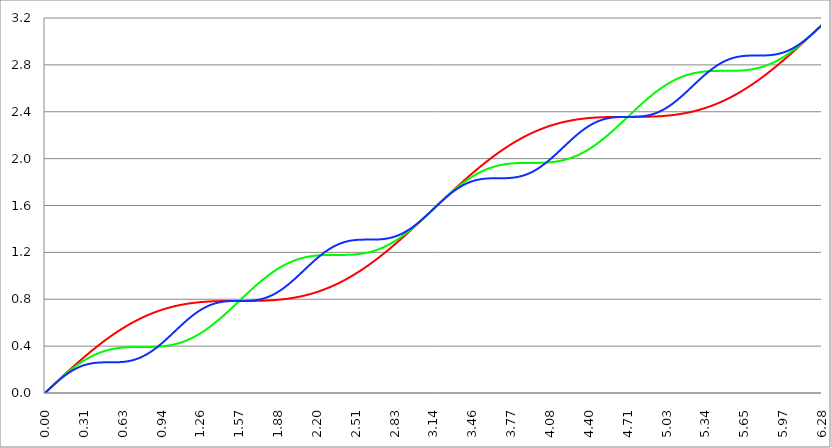
| Category | Series 1 | Series 0 | Series 2 |
|---|---|---|---|
| 0.0 | 0 | 0 | 0 |
| 0.00314159265358979 | 0.003 | 0.003 | 0.003 |
| 0.00628318530717958 | 0.006 | 0.006 | 0.006 |
| 0.00942477796076938 | 0.009 | 0.009 | 0.009 |
| 0.0125663706143592 | 0.013 | 0.013 | 0.013 |
| 0.015707963267949 | 0.016 | 0.016 | 0.016 |
| 0.0188495559215388 | 0.019 | 0.019 | 0.019 |
| 0.0219911485751285 | 0.022 | 0.022 | 0.022 |
| 0.0251327412287183 | 0.025 | 0.025 | 0.025 |
| 0.0282743338823081 | 0.028 | 0.028 | 0.028 |
| 0.0314159265358979 | 0.031 | 0.031 | 0.031 |
| 0.0345575191894877 | 0.035 | 0.035 | 0.034 |
| 0.0376991118430775 | 0.038 | 0.038 | 0.038 |
| 0.0408407044966673 | 0.041 | 0.041 | 0.041 |
| 0.0439822971502571 | 0.044 | 0.044 | 0.044 |
| 0.0471238898038469 | 0.047 | 0.047 | 0.047 |
| 0.0502654824574367 | 0.05 | 0.05 | 0.05 |
| 0.0534070751110265 | 0.053 | 0.053 | 0.053 |
| 0.0565486677646163 | 0.056 | 0.056 | 0.056 |
| 0.059690260418206 | 0.06 | 0.059 | 0.059 |
| 0.0628318530717958 | 0.063 | 0.063 | 0.062 |
| 0.0659734457253856 | 0.066 | 0.066 | 0.065 |
| 0.0691150383789754 | 0.069 | 0.069 | 0.068 |
| 0.0722566310325652 | 0.072 | 0.072 | 0.071 |
| 0.075398223686155 | 0.075 | 0.075 | 0.074 |
| 0.0785398163397448 | 0.078 | 0.078 | 0.077 |
| 0.0816814089933346 | 0.081 | 0.081 | 0.08 |
| 0.0848230016469244 | 0.085 | 0.084 | 0.083 |
| 0.0879645943005142 | 0.088 | 0.087 | 0.086 |
| 0.091106186954104 | 0.091 | 0.09 | 0.089 |
| 0.0942477796076937 | 0.094 | 0.093 | 0.092 |
| 0.0973893722612835 | 0.097 | 0.096 | 0.095 |
| 0.100530964914873 | 0.1 | 0.099 | 0.098 |
| 0.103672557568463 | 0.103 | 0.102 | 0.1 |
| 0.106814150222053 | 0.106 | 0.105 | 0.103 |
| 0.109955742875643 | 0.11 | 0.108 | 0.106 |
| 0.113097335529233 | 0.113 | 0.111 | 0.109 |
| 0.116238928182822 | 0.116 | 0.114 | 0.112 |
| 0.119380520836412 | 0.119 | 0.117 | 0.114 |
| 0.122522113490002 | 0.122 | 0.12 | 0.117 |
| 0.125663706143592 | 0.125 | 0.123 | 0.12 |
| 0.128805298797181 | 0.128 | 0.126 | 0.123 |
| 0.131946891450771 | 0.131 | 0.129 | 0.125 |
| 0.135088484104361 | 0.134 | 0.132 | 0.128 |
| 0.138230076757951 | 0.137 | 0.135 | 0.131 |
| 0.141371669411541 | 0.14 | 0.138 | 0.133 |
| 0.14451326206513 | 0.144 | 0.141 | 0.136 |
| 0.14765485471872 | 0.147 | 0.143 | 0.138 |
| 0.15079644737231 | 0.15 | 0.146 | 0.141 |
| 0.1539380400259 | 0.153 | 0.149 | 0.143 |
| 0.15707963267949 | 0.156 | 0.152 | 0.146 |
| 0.160221225333079 | 0.159 | 0.155 | 0.148 |
| 0.163362817986669 | 0.162 | 0.158 | 0.151 |
| 0.166504410640259 | 0.165 | 0.16 | 0.153 |
| 0.169646003293849 | 0.168 | 0.163 | 0.156 |
| 0.172787595947439 | 0.171 | 0.166 | 0.158 |
| 0.175929188601028 | 0.174 | 0.169 | 0.16 |
| 0.179070781254618 | 0.177 | 0.172 | 0.163 |
| 0.182212373908208 | 0.18 | 0.174 | 0.165 |
| 0.185353966561798 | 0.183 | 0.177 | 0.167 |
| 0.188495559215388 | 0.186 | 0.18 | 0.17 |
| 0.191637151868977 | 0.189 | 0.183 | 0.172 |
| 0.194778744522567 | 0.192 | 0.185 | 0.174 |
| 0.197920337176157 | 0.195 | 0.188 | 0.176 |
| 0.201061929829747 | 0.198 | 0.191 | 0.178 |
| 0.204203522483336 | 0.201 | 0.193 | 0.181 |
| 0.207345115136926 | 0.204 | 0.196 | 0.183 |
| 0.210486707790516 | 0.207 | 0.198 | 0.185 |
| 0.213628300444106 | 0.21 | 0.201 | 0.187 |
| 0.216769893097696 | 0.213 | 0.204 | 0.189 |
| 0.219911485751285 | 0.216 | 0.206 | 0.191 |
| 0.223053078404875 | 0.219 | 0.209 | 0.193 |
| 0.226194671058465 | 0.222 | 0.211 | 0.195 |
| 0.229336263712055 | 0.225 | 0.214 | 0.196 |
| 0.232477856365645 | 0.228 | 0.216 | 0.198 |
| 0.235619449019234 | 0.231 | 0.219 | 0.2 |
| 0.238761041672824 | 0.234 | 0.221 | 0.202 |
| 0.241902634326414 | 0.237 | 0.224 | 0.204 |
| 0.245044226980004 | 0.24 | 0.226 | 0.205 |
| 0.248185819633594 | 0.243 | 0.229 | 0.207 |
| 0.251327412287183 | 0.246 | 0.231 | 0.209 |
| 0.254469004940773 | 0.249 | 0.234 | 0.21 |
| 0.257610597594363 | 0.252 | 0.236 | 0.212 |
| 0.260752190247953 | 0.255 | 0.238 | 0.214 |
| 0.263893782901543 | 0.258 | 0.241 | 0.215 |
| 0.267035375555132 | 0.261 | 0.243 | 0.217 |
| 0.270176968208722 | 0.264 | 0.245 | 0.218 |
| 0.273318560862312 | 0.267 | 0.248 | 0.22 |
| 0.276460153515902 | 0.27 | 0.25 | 0.221 |
| 0.279601746169492 | 0.272 | 0.252 | 0.223 |
| 0.282743338823082 | 0.275 | 0.254 | 0.224 |
| 0.285884931476671 | 0.278 | 0.257 | 0.225 |
| 0.289026524130261 | 0.281 | 0.259 | 0.227 |
| 0.292168116783851 | 0.284 | 0.261 | 0.228 |
| 0.295309709437441 | 0.287 | 0.263 | 0.229 |
| 0.298451302091031 | 0.29 | 0.265 | 0.231 |
| 0.30159289474462 | 0.293 | 0.268 | 0.232 |
| 0.30473448739821 | 0.295 | 0.27 | 0.233 |
| 0.3078760800518 | 0.298 | 0.272 | 0.234 |
| 0.31101767270539 | 0.301 | 0.274 | 0.235 |
| 0.31415926535898 | 0.304 | 0.276 | 0.236 |
| 0.31730085801257 | 0.307 | 0.278 | 0.237 |
| 0.320442450666159 | 0.31 | 0.28 | 0.238 |
| 0.323584043319749 | 0.313 | 0.282 | 0.239 |
| 0.326725635973339 | 0.315 | 0.284 | 0.24 |
| 0.329867228626929 | 0.318 | 0.286 | 0.241 |
| 0.333008821280519 | 0.321 | 0.288 | 0.242 |
| 0.336150413934108 | 0.324 | 0.29 | 0.243 |
| 0.339292006587698 | 0.327 | 0.292 | 0.244 |
| 0.342433599241288 | 0.329 | 0.294 | 0.245 |
| 0.345575191894878 | 0.332 | 0.296 | 0.246 |
| 0.348716784548468 | 0.335 | 0.297 | 0.247 |
| 0.351858377202058 | 0.338 | 0.299 | 0.247 |
| 0.354999969855647 | 0.34 | 0.301 | 0.248 |
| 0.358141562509237 | 0.343 | 0.303 | 0.249 |
| 0.361283155162827 | 0.346 | 0.305 | 0.25 |
| 0.364424747816417 | 0.349 | 0.306 | 0.25 |
| 0.367566340470007 | 0.351 | 0.308 | 0.251 |
| 0.370707933123597 | 0.354 | 0.31 | 0.252 |
| 0.373849525777186 | 0.357 | 0.312 | 0.252 |
| 0.376991118430776 | 0.36 | 0.313 | 0.253 |
| 0.380132711084366 | 0.362 | 0.315 | 0.253 |
| 0.383274303737956 | 0.365 | 0.317 | 0.254 |
| 0.386415896391546 | 0.368 | 0.318 | 0.254 |
| 0.389557489045135 | 0.37 | 0.32 | 0.255 |
| 0.392699081698725 | 0.373 | 0.321 | 0.255 |
| 0.395840674352315 | 0.376 | 0.323 | 0.256 |
| 0.398982267005905 | 0.378 | 0.324 | 0.256 |
| 0.402123859659495 | 0.381 | 0.326 | 0.257 |
| 0.405265452313085 | 0.384 | 0.327 | 0.257 |
| 0.408407044966674 | 0.386 | 0.329 | 0.257 |
| 0.411548637620264 | 0.389 | 0.33 | 0.258 |
| 0.414690230273854 | 0.392 | 0.332 | 0.258 |
| 0.417831822927444 | 0.394 | 0.333 | 0.258 |
| 0.420973415581034 | 0.397 | 0.335 | 0.259 |
| 0.424115008234623 | 0.4 | 0.336 | 0.259 |
| 0.427256600888213 | 0.402 | 0.337 | 0.259 |
| 0.430398193541803 | 0.405 | 0.339 | 0.259 |
| 0.433539786195393 | 0.407 | 0.34 | 0.26 |
| 0.436681378848983 | 0.41 | 0.341 | 0.26 |
| 0.439822971502573 | 0.413 | 0.343 | 0.26 |
| 0.442964564156162 | 0.415 | 0.344 | 0.26 |
| 0.446106156809752 | 0.418 | 0.345 | 0.26 |
| 0.449247749463342 | 0.42 | 0.346 | 0.261 |
| 0.452389342116932 | 0.423 | 0.348 | 0.261 |
| 0.455530934770522 | 0.425 | 0.349 | 0.261 |
| 0.458672527424111 | 0.428 | 0.35 | 0.261 |
| 0.461814120077701 | 0.43 | 0.351 | 0.261 |
| 0.464955712731291 | 0.433 | 0.352 | 0.261 |
| 0.468097305384881 | 0.435 | 0.353 | 0.261 |
| 0.471238898038471 | 0.438 | 0.355 | 0.261 |
| 0.474380490692061 | 0.44 | 0.356 | 0.261 |
| 0.47752208334565 | 0.443 | 0.357 | 0.262 |
| 0.48066367599924 | 0.445 | 0.358 | 0.262 |
| 0.48380526865283 | 0.448 | 0.359 | 0.262 |
| 0.48694686130642 | 0.45 | 0.36 | 0.262 |
| 0.49008845396001 | 0.453 | 0.361 | 0.262 |
| 0.493230046613599 | 0.455 | 0.362 | 0.262 |
| 0.496371639267189 | 0.458 | 0.363 | 0.262 |
| 0.499513231920779 | 0.46 | 0.364 | 0.262 |
| 0.502654824574369 | 0.462 | 0.364 | 0.262 |
| 0.505796417227959 | 0.465 | 0.365 | 0.262 |
| 0.508938009881549 | 0.467 | 0.366 | 0.262 |
| 0.512079602535138 | 0.47 | 0.367 | 0.262 |
| 0.515221195188728 | 0.472 | 0.368 | 0.262 |
| 0.518362787842318 | 0.474 | 0.369 | 0.262 |
| 0.521504380495908 | 0.477 | 0.37 | 0.262 |
| 0.524645973149498 | 0.479 | 0.37 | 0.262 |
| 0.527787565803087 | 0.481 | 0.371 | 0.262 |
| 0.530929158456677 | 0.484 | 0.372 | 0.262 |
| 0.534070751110267 | 0.486 | 0.373 | 0.262 |
| 0.537212343763857 | 0.488 | 0.373 | 0.262 |
| 0.540353936417447 | 0.491 | 0.374 | 0.262 |
| 0.543495529071037 | 0.493 | 0.375 | 0.262 |
| 0.546637121724626 | 0.495 | 0.375 | 0.262 |
| 0.549778714378216 | 0.498 | 0.376 | 0.262 |
| 0.552920307031806 | 0.5 | 0.377 | 0.262 |
| 0.556061899685396 | 0.502 | 0.377 | 0.262 |
| 0.559203492338986 | 0.504 | 0.378 | 0.262 |
| 0.562345084992576 | 0.507 | 0.378 | 0.262 |
| 0.565486677646165 | 0.509 | 0.379 | 0.262 |
| 0.568628270299755 | 0.511 | 0.38 | 0.262 |
| 0.571769862953345 | 0.513 | 0.38 | 0.262 |
| 0.574911455606935 | 0.516 | 0.381 | 0.262 |
| 0.578053048260525 | 0.518 | 0.381 | 0.262 |
| 0.581194640914114 | 0.52 | 0.382 | 0.262 |
| 0.584336233567704 | 0.522 | 0.382 | 0.262 |
| 0.587477826221294 | 0.524 | 0.383 | 0.263 |
| 0.590619418874884 | 0.527 | 0.383 | 0.263 |
| 0.593761011528474 | 0.529 | 0.384 | 0.263 |
| 0.596902604182064 | 0.531 | 0.384 | 0.263 |
| 0.600044196835653 | 0.533 | 0.384 | 0.263 |
| 0.603185789489243 | 0.535 | 0.385 | 0.263 |
| 0.606327382142833 | 0.537 | 0.385 | 0.263 |
| 0.609468974796423 | 0.539 | 0.386 | 0.264 |
| 0.612610567450013 | 0.542 | 0.386 | 0.264 |
| 0.615752160103602 | 0.544 | 0.386 | 0.264 |
| 0.618893752757192 | 0.546 | 0.387 | 0.264 |
| 0.622035345410782 | 0.548 | 0.387 | 0.265 |
| 0.625176938064372 | 0.55 | 0.387 | 0.265 |
| 0.628318530717962 | 0.552 | 0.388 | 0.265 |
| 0.631460123371551 | 0.554 | 0.388 | 0.265 |
| 0.634601716025141 | 0.556 | 0.388 | 0.266 |
| 0.637743308678731 | 0.558 | 0.388 | 0.266 |
| 0.640884901332321 | 0.56 | 0.389 | 0.267 |
| 0.644026493985911 | 0.562 | 0.389 | 0.267 |
| 0.647168086639501 | 0.564 | 0.389 | 0.267 |
| 0.65030967929309 | 0.566 | 0.389 | 0.268 |
| 0.65345127194668 | 0.568 | 0.39 | 0.268 |
| 0.65659286460027 | 0.57 | 0.39 | 0.269 |
| 0.65973445725386 | 0.572 | 0.39 | 0.269 |
| 0.66287604990745 | 0.574 | 0.39 | 0.27 |
| 0.666017642561039 | 0.576 | 0.39 | 0.27 |
| 0.669159235214629 | 0.578 | 0.391 | 0.271 |
| 0.672300827868219 | 0.58 | 0.391 | 0.271 |
| 0.675442420521809 | 0.582 | 0.391 | 0.272 |
| 0.678584013175399 | 0.584 | 0.391 | 0.272 |
| 0.681725605828989 | 0.586 | 0.391 | 0.273 |
| 0.684867198482578 | 0.587 | 0.391 | 0.274 |
| 0.688008791136168 | 0.589 | 0.391 | 0.274 |
| 0.691150383789758 | 0.591 | 0.392 | 0.275 |
| 0.694291976443348 | 0.593 | 0.392 | 0.276 |
| 0.697433569096938 | 0.595 | 0.392 | 0.277 |
| 0.700575161750528 | 0.597 | 0.392 | 0.278 |
| 0.703716754404117 | 0.599 | 0.392 | 0.278 |
| 0.706858347057707 | 0.6 | 0.392 | 0.279 |
| 0.709999939711297 | 0.602 | 0.392 | 0.28 |
| 0.713141532364887 | 0.604 | 0.392 | 0.281 |
| 0.716283125018477 | 0.606 | 0.392 | 0.282 |
| 0.719424717672066 | 0.608 | 0.392 | 0.283 |
| 0.722566310325656 | 0.609 | 0.392 | 0.284 |
| 0.725707902979246 | 0.611 | 0.392 | 0.285 |
| 0.728849495632836 | 0.613 | 0.392 | 0.286 |
| 0.731991088286426 | 0.615 | 0.392 | 0.287 |
| 0.735132680940016 | 0.616 | 0.393 | 0.288 |
| 0.738274273593605 | 0.618 | 0.393 | 0.289 |
| 0.741415866247195 | 0.62 | 0.393 | 0.29 |
| 0.744557458900785 | 0.621 | 0.393 | 0.291 |
| 0.747699051554375 | 0.623 | 0.393 | 0.293 |
| 0.750840644207965 | 0.625 | 0.393 | 0.294 |
| 0.753982236861554 | 0.626 | 0.393 | 0.295 |
| 0.757123829515144 | 0.628 | 0.393 | 0.296 |
| 0.760265422168734 | 0.63 | 0.393 | 0.298 |
| 0.763407014822324 | 0.631 | 0.393 | 0.299 |
| 0.766548607475914 | 0.633 | 0.393 | 0.3 |
| 0.769690200129504 | 0.635 | 0.393 | 0.302 |
| 0.772831792783093 | 0.636 | 0.393 | 0.303 |
| 0.775973385436683 | 0.638 | 0.393 | 0.305 |
| 0.779114978090273 | 0.64 | 0.393 | 0.306 |
| 0.782256570743863 | 0.641 | 0.393 | 0.308 |
| 0.785398163397453 | 0.643 | 0.393 | 0.309 |
| 0.788539756051042 | 0.644 | 0.393 | 0.311 |
| 0.791681348704632 | 0.646 | 0.393 | 0.313 |
| 0.794822941358222 | 0.647 | 0.393 | 0.314 |
| 0.797964534011812 | 0.649 | 0.393 | 0.316 |
| 0.801106126665402 | 0.65 | 0.393 | 0.318 |
| 0.804247719318992 | 0.652 | 0.393 | 0.319 |
| 0.807389311972581 | 0.653 | 0.393 | 0.321 |
| 0.810530904626171 | 0.655 | 0.393 | 0.323 |
| 0.813672497279761 | 0.656 | 0.393 | 0.325 |
| 0.816814089933351 | 0.658 | 0.393 | 0.327 |
| 0.819955682586941 | 0.659 | 0.393 | 0.328 |
| 0.823097275240531 | 0.661 | 0.393 | 0.33 |
| 0.82623886789412 | 0.662 | 0.393 | 0.332 |
| 0.82938046054771 | 0.664 | 0.393 | 0.334 |
| 0.8325220532013 | 0.665 | 0.393 | 0.336 |
| 0.83566364585489 | 0.667 | 0.393 | 0.338 |
| 0.83880523850848 | 0.668 | 0.393 | 0.34 |
| 0.841946831162069 | 0.669 | 0.393 | 0.342 |
| 0.845088423815659 | 0.671 | 0.393 | 0.344 |
| 0.848230016469249 | 0.672 | 0.393 | 0.347 |
| 0.851371609122839 | 0.674 | 0.393 | 0.349 |
| 0.854513201776429 | 0.675 | 0.393 | 0.351 |
| 0.857654794430019 | 0.676 | 0.393 | 0.353 |
| 0.860796387083608 | 0.678 | 0.393 | 0.355 |
| 0.863937979737198 | 0.679 | 0.393 | 0.358 |
| 0.867079572390788 | 0.68 | 0.393 | 0.36 |
| 0.870221165044378 | 0.682 | 0.394 | 0.362 |
| 0.873362757697968 | 0.683 | 0.394 | 0.365 |
| 0.876504350351557 | 0.684 | 0.394 | 0.367 |
| 0.879645943005147 | 0.685 | 0.394 | 0.369 |
| 0.882787535658737 | 0.687 | 0.394 | 0.372 |
| 0.885929128312327 | 0.688 | 0.394 | 0.374 |
| 0.889070720965917 | 0.689 | 0.394 | 0.377 |
| 0.892212313619507 | 0.69 | 0.394 | 0.379 |
| 0.895353906273096 | 0.692 | 0.394 | 0.382 |
| 0.898495498926686 | 0.693 | 0.395 | 0.384 |
| 0.901637091580276 | 0.694 | 0.395 | 0.387 |
| 0.904778684233866 | 0.695 | 0.395 | 0.39 |
| 0.907920276887456 | 0.696 | 0.395 | 0.392 |
| 0.911061869541045 | 0.698 | 0.395 | 0.395 |
| 0.914203462194635 | 0.699 | 0.396 | 0.397 |
| 0.917345054848225 | 0.7 | 0.396 | 0.4 |
| 0.920486647501815 | 0.701 | 0.396 | 0.403 |
| 0.923628240155405 | 0.702 | 0.396 | 0.406 |
| 0.926769832808995 | 0.703 | 0.396 | 0.408 |
| 0.929911425462584 | 0.705 | 0.397 | 0.411 |
| 0.933053018116174 | 0.706 | 0.397 | 0.414 |
| 0.936194610769764 | 0.707 | 0.397 | 0.417 |
| 0.939336203423354 | 0.708 | 0.397 | 0.419 |
| 0.942477796076944 | 0.709 | 0.398 | 0.422 |
| 0.945619388730533 | 0.71 | 0.398 | 0.425 |
| 0.948760981384123 | 0.711 | 0.398 | 0.428 |
| 0.951902574037713 | 0.712 | 0.399 | 0.431 |
| 0.955044166691303 | 0.713 | 0.399 | 0.434 |
| 0.958185759344893 | 0.714 | 0.399 | 0.437 |
| 0.961327351998483 | 0.715 | 0.4 | 0.44 |
| 0.964468944652072 | 0.716 | 0.4 | 0.443 |
| 0.967610537305662 | 0.717 | 0.401 | 0.446 |
| 0.970752129959252 | 0.718 | 0.401 | 0.448 |
| 0.973893722612842 | 0.719 | 0.401 | 0.451 |
| 0.977035315266432 | 0.72 | 0.402 | 0.454 |
| 0.980176907920022 | 0.721 | 0.402 | 0.457 |
| 0.983318500573611 | 0.722 | 0.403 | 0.46 |
| 0.986460093227201 | 0.723 | 0.403 | 0.464 |
| 0.989601685880791 | 0.724 | 0.404 | 0.467 |
| 0.992743278534381 | 0.725 | 0.404 | 0.47 |
| 0.995884871187971 | 0.726 | 0.405 | 0.473 |
| 0.99902646384156 | 0.727 | 0.405 | 0.476 |
| 1.00216805649515 | 0.728 | 0.406 | 0.479 |
| 1.00530964914874 | 0.729 | 0.406 | 0.482 |
| 1.00845124180233 | 0.73 | 0.407 | 0.485 |
| 1.01159283445592 | 0.731 | 0.408 | 0.488 |
| 1.01473442710951 | 0.732 | 0.408 | 0.491 |
| 1.017876019763099 | 0.732 | 0.409 | 0.494 |
| 1.021017612416689 | 0.733 | 0.409 | 0.497 |
| 1.02415920507028 | 0.734 | 0.41 | 0.501 |
| 1.027300797723869 | 0.735 | 0.411 | 0.504 |
| 1.030442390377459 | 0.736 | 0.411 | 0.507 |
| 1.033583983031048 | 0.737 | 0.412 | 0.51 |
| 1.036725575684638 | 0.737 | 0.413 | 0.513 |
| 1.039867168338228 | 0.738 | 0.414 | 0.516 |
| 1.043008760991818 | 0.739 | 0.414 | 0.519 |
| 1.046150353645408 | 0.74 | 0.415 | 0.523 |
| 1.049291946298998 | 0.741 | 0.416 | 0.526 |
| 1.052433538952587 | 0.741 | 0.417 | 0.529 |
| 1.055575131606177 | 0.742 | 0.418 | 0.532 |
| 1.058716724259767 | 0.743 | 0.418 | 0.535 |
| 1.061858316913357 | 0.744 | 0.419 | 0.538 |
| 1.064999909566947 | 0.744 | 0.42 | 0.541 |
| 1.068141502220536 | 0.745 | 0.421 | 0.545 |
| 1.071283094874126 | 0.746 | 0.422 | 0.548 |
| 1.074424687527716 | 0.747 | 0.423 | 0.551 |
| 1.077566280181306 | 0.747 | 0.424 | 0.554 |
| 1.080707872834896 | 0.748 | 0.425 | 0.557 |
| 1.083849465488486 | 0.749 | 0.426 | 0.56 |
| 1.086991058142075 | 0.749 | 0.427 | 0.563 |
| 1.090132650795665 | 0.75 | 0.428 | 0.566 |
| 1.093274243449255 | 0.751 | 0.429 | 0.569 |
| 1.096415836102845 | 0.751 | 0.43 | 0.572 |
| 1.099557428756435 | 0.752 | 0.431 | 0.576 |
| 1.102699021410025 | 0.753 | 0.432 | 0.579 |
| 1.105840614063614 | 0.753 | 0.433 | 0.582 |
| 1.108982206717204 | 0.754 | 0.434 | 0.585 |
| 1.112123799370794 | 0.755 | 0.435 | 0.588 |
| 1.115265392024384 | 0.755 | 0.437 | 0.591 |
| 1.118406984677974 | 0.756 | 0.438 | 0.594 |
| 1.121548577331563 | 0.756 | 0.439 | 0.597 |
| 1.124690169985153 | 0.757 | 0.44 | 0.6 |
| 1.127831762638743 | 0.758 | 0.441 | 0.603 |
| 1.130973355292333 | 0.758 | 0.443 | 0.606 |
| 1.134114947945923 | 0.759 | 0.444 | 0.609 |
| 1.137256540599513 | 0.759 | 0.445 | 0.611 |
| 1.140398133253102 | 0.76 | 0.447 | 0.614 |
| 1.143539725906692 | 0.76 | 0.448 | 0.617 |
| 1.146681318560282 | 0.761 | 0.449 | 0.62 |
| 1.149822911213872 | 0.761 | 0.451 | 0.623 |
| 1.152964503867462 | 0.762 | 0.452 | 0.626 |
| 1.156106096521051 | 0.762 | 0.454 | 0.629 |
| 1.159247689174641 | 0.763 | 0.455 | 0.632 |
| 1.162389281828231 | 0.763 | 0.456 | 0.634 |
| 1.165530874481821 | 0.764 | 0.458 | 0.637 |
| 1.168672467135411 | 0.764 | 0.459 | 0.64 |
| 1.171814059789001 | 0.765 | 0.461 | 0.643 |
| 1.17495565244259 | 0.765 | 0.462 | 0.645 |
| 1.17809724509618 | 0.766 | 0.464 | 0.648 |
| 1.18123883774977 | 0.766 | 0.466 | 0.651 |
| 1.18438043040336 | 0.767 | 0.467 | 0.653 |
| 1.18752202305695 | 0.767 | 0.469 | 0.656 |
| 1.190663615710539 | 0.768 | 0.47 | 0.659 |
| 1.193805208364129 | 0.768 | 0.472 | 0.661 |
| 1.19694680101772 | 0.768 | 0.474 | 0.664 |
| 1.200088393671309 | 0.769 | 0.476 | 0.666 |
| 1.203229986324899 | 0.769 | 0.477 | 0.669 |
| 1.206371578978489 | 0.77 | 0.479 | 0.671 |
| 1.209513171632078 | 0.77 | 0.481 | 0.674 |
| 1.212654764285668 | 0.77 | 0.483 | 0.676 |
| 1.215796356939258 | 0.771 | 0.484 | 0.679 |
| 1.218937949592848 | 0.771 | 0.486 | 0.681 |
| 1.222079542246438 | 0.772 | 0.488 | 0.683 |
| 1.225221134900027 | 0.772 | 0.49 | 0.686 |
| 1.228362727553617 | 0.772 | 0.492 | 0.688 |
| 1.231504320207207 | 0.773 | 0.494 | 0.69 |
| 1.234645912860797 | 0.773 | 0.496 | 0.693 |
| 1.237787505514387 | 0.773 | 0.497 | 0.695 |
| 1.240929098167977 | 0.774 | 0.499 | 0.697 |
| 1.244070690821566 | 0.774 | 0.501 | 0.699 |
| 1.247212283475156 | 0.774 | 0.503 | 0.701 |
| 1.250353876128746 | 0.775 | 0.505 | 0.703 |
| 1.253495468782336 | 0.775 | 0.507 | 0.706 |
| 1.256637061435926 | 0.775 | 0.509 | 0.708 |
| 1.259778654089515 | 0.776 | 0.512 | 0.71 |
| 1.262920246743105 | 0.776 | 0.514 | 0.712 |
| 1.266061839396695 | 0.776 | 0.516 | 0.714 |
| 1.269203432050285 | 0.776 | 0.518 | 0.716 |
| 1.272345024703875 | 0.777 | 0.52 | 0.717 |
| 1.275486617357465 | 0.777 | 0.522 | 0.719 |
| 1.278628210011054 | 0.777 | 0.524 | 0.721 |
| 1.281769802664644 | 0.777 | 0.526 | 0.723 |
| 1.284911395318234 | 0.778 | 0.529 | 0.725 |
| 1.288052987971824 | 0.778 | 0.531 | 0.727 |
| 1.291194580625414 | 0.778 | 0.533 | 0.728 |
| 1.294336173279003 | 0.778 | 0.535 | 0.73 |
| 1.297477765932593 | 0.779 | 0.538 | 0.732 |
| 1.300619358586183 | 0.779 | 0.54 | 0.734 |
| 1.303760951239773 | 0.779 | 0.542 | 0.735 |
| 1.306902543893363 | 0.779 | 0.545 | 0.737 |
| 1.310044136546953 | 0.78 | 0.547 | 0.738 |
| 1.313185729200542 | 0.78 | 0.549 | 0.74 |
| 1.316327321854132 | 0.78 | 0.552 | 0.741 |
| 1.319468914507722 | 0.78 | 0.554 | 0.743 |
| 1.322610507161312 | 0.78 | 0.557 | 0.744 |
| 1.325752099814902 | 0.781 | 0.559 | 0.746 |
| 1.328893692468491 | 0.781 | 0.562 | 0.747 |
| 1.332035285122081 | 0.781 | 0.564 | 0.749 |
| 1.335176877775671 | 0.781 | 0.566 | 0.75 |
| 1.338318470429261 | 0.781 | 0.569 | 0.751 |
| 1.341460063082851 | 0.781 | 0.571 | 0.752 |
| 1.344601655736441 | 0.782 | 0.574 | 0.754 |
| 1.34774324839003 | 0.782 | 0.577 | 0.755 |
| 1.35088484104362 | 0.782 | 0.579 | 0.756 |
| 1.35402643369721 | 0.782 | 0.582 | 0.757 |
| 1.3571680263508 | 0.782 | 0.584 | 0.758 |
| 1.36030961900439 | 0.782 | 0.587 | 0.76 |
| 1.363451211657979 | 0.782 | 0.59 | 0.761 |
| 1.36659280431157 | 0.783 | 0.592 | 0.762 |
| 1.369734396965159 | 0.783 | 0.595 | 0.763 |
| 1.372875989618749 | 0.783 | 0.597 | 0.764 |
| 1.376017582272339 | 0.783 | 0.6 | 0.765 |
| 1.379159174925929 | 0.783 | 0.603 | 0.766 |
| 1.382300767579518 | 0.783 | 0.606 | 0.767 |
| 1.385442360233108 | 0.783 | 0.608 | 0.767 |
| 1.388583952886698 | 0.783 | 0.611 | 0.768 |
| 1.391725545540288 | 0.783 | 0.614 | 0.769 |
| 1.394867138193878 | 0.784 | 0.617 | 0.77 |
| 1.398008730847468 | 0.784 | 0.619 | 0.771 |
| 1.401150323501057 | 0.784 | 0.622 | 0.771 |
| 1.404291916154647 | 0.784 | 0.625 | 0.772 |
| 1.407433508808237 | 0.784 | 0.628 | 0.773 |
| 1.410575101461827 | 0.784 | 0.631 | 0.774 |
| 1.413716694115417 | 0.784 | 0.633 | 0.774 |
| 1.416858286769006 | 0.784 | 0.636 | 0.775 |
| 1.419999879422596 | 0.784 | 0.639 | 0.776 |
| 1.423141472076186 | 0.784 | 0.642 | 0.776 |
| 1.426283064729776 | 0.784 | 0.645 | 0.777 |
| 1.429424657383366 | 0.784 | 0.648 | 0.777 |
| 1.432566250036956 | 0.785 | 0.651 | 0.778 |
| 1.435707842690545 | 0.785 | 0.654 | 0.778 |
| 1.438849435344135 | 0.785 | 0.656 | 0.779 |
| 1.441991027997725 | 0.785 | 0.659 | 0.779 |
| 1.445132620651315 | 0.785 | 0.662 | 0.78 |
| 1.448274213304905 | 0.785 | 0.665 | 0.78 |
| 1.451415805958494 | 0.785 | 0.668 | 0.78 |
| 1.454557398612084 | 0.785 | 0.671 | 0.781 |
| 1.457698991265674 | 0.785 | 0.674 | 0.781 |
| 1.460840583919264 | 0.785 | 0.677 | 0.781 |
| 1.463982176572854 | 0.785 | 0.68 | 0.782 |
| 1.467123769226444 | 0.785 | 0.683 | 0.782 |
| 1.470265361880033 | 0.785 | 0.686 | 0.782 |
| 1.473406954533623 | 0.785 | 0.689 | 0.783 |
| 1.476548547187213 | 0.785 | 0.692 | 0.783 |
| 1.479690139840803 | 0.785 | 0.695 | 0.783 |
| 1.482831732494393 | 0.785 | 0.698 | 0.783 |
| 1.485973325147982 | 0.785 | 0.701 | 0.784 |
| 1.489114917801572 | 0.785 | 0.704 | 0.784 |
| 1.492256510455162 | 0.785 | 0.708 | 0.784 |
| 1.495398103108752 | 0.785 | 0.711 | 0.784 |
| 1.498539695762342 | 0.785 | 0.714 | 0.784 |
| 1.501681288415932 | 0.785 | 0.717 | 0.784 |
| 1.504822881069521 | 0.785 | 0.72 | 0.785 |
| 1.507964473723111 | 0.785 | 0.723 | 0.785 |
| 1.511106066376701 | 0.785 | 0.726 | 0.785 |
| 1.514247659030291 | 0.785 | 0.729 | 0.785 |
| 1.517389251683881 | 0.785 | 0.732 | 0.785 |
| 1.520530844337471 | 0.785 | 0.735 | 0.785 |
| 1.52367243699106 | 0.785 | 0.738 | 0.785 |
| 1.52681402964465 | 0.785 | 0.742 | 0.785 |
| 1.52995562229824 | 0.785 | 0.745 | 0.785 |
| 1.53309721495183 | 0.785 | 0.748 | 0.785 |
| 1.53623880760542 | 0.785 | 0.751 | 0.785 |
| 1.539380400259009 | 0.785 | 0.754 | 0.785 |
| 1.542521992912599 | 0.785 | 0.757 | 0.785 |
| 1.545663585566189 | 0.785 | 0.76 | 0.785 |
| 1.548805178219779 | 0.785 | 0.763 | 0.785 |
| 1.551946770873369 | 0.785 | 0.767 | 0.785 |
| 1.555088363526959 | 0.785 | 0.77 | 0.785 |
| 1.558229956180548 | 0.785 | 0.773 | 0.785 |
| 1.561371548834138 | 0.785 | 0.776 | 0.785 |
| 1.564513141487728 | 0.785 | 0.779 | 0.785 |
| 1.567654734141318 | 0.785 | 0.782 | 0.785 |
| 1.570796326794908 | 0.785 | 0.785 | 0.785 |
| 1.573937919448497 | 0.785 | 0.789 | 0.785 |
| 1.577079512102087 | 0.785 | 0.792 | 0.785 |
| 1.580221104755677 | 0.785 | 0.795 | 0.785 |
| 1.583362697409267 | 0.785 | 0.798 | 0.785 |
| 1.586504290062857 | 0.785 | 0.801 | 0.785 |
| 1.589645882716447 | 0.785 | 0.804 | 0.785 |
| 1.592787475370036 | 0.785 | 0.807 | 0.785 |
| 1.595929068023626 | 0.785 | 0.811 | 0.785 |
| 1.599070660677216 | 0.785 | 0.814 | 0.785 |
| 1.602212253330806 | 0.785 | 0.817 | 0.785 |
| 1.605353845984396 | 0.785 | 0.82 | 0.786 |
| 1.608495438637985 | 0.785 | 0.823 | 0.786 |
| 1.611637031291575 | 0.785 | 0.826 | 0.786 |
| 1.614778623945165 | 0.785 | 0.829 | 0.786 |
| 1.617920216598755 | 0.785 | 0.832 | 0.786 |
| 1.621061809252345 | 0.785 | 0.835 | 0.786 |
| 1.624203401905935 | 0.785 | 0.839 | 0.786 |
| 1.627344994559524 | 0.785 | 0.842 | 0.786 |
| 1.630486587213114 | 0.785 | 0.845 | 0.786 |
| 1.633628179866704 | 0.785 | 0.848 | 0.786 |
| 1.636769772520294 | 0.785 | 0.851 | 0.786 |
| 1.639911365173884 | 0.786 | 0.854 | 0.786 |
| 1.643052957827473 | 0.786 | 0.857 | 0.787 |
| 1.646194550481063 | 0.786 | 0.86 | 0.787 |
| 1.649336143134653 | 0.786 | 0.863 | 0.787 |
| 1.652477735788243 | 0.786 | 0.866 | 0.787 |
| 1.655619328441833 | 0.786 | 0.869 | 0.787 |
| 1.658760921095423 | 0.786 | 0.872 | 0.787 |
| 1.661902513749012 | 0.786 | 0.876 | 0.788 |
| 1.665044106402602 | 0.786 | 0.879 | 0.788 |
| 1.668185699056192 | 0.786 | 0.882 | 0.788 |
| 1.671327291709782 | 0.786 | 0.885 | 0.788 |
| 1.674468884363372 | 0.786 | 0.888 | 0.789 |
| 1.677610477016961 | 0.786 | 0.891 | 0.789 |
| 1.680752069670551 | 0.786 | 0.894 | 0.789 |
| 1.683893662324141 | 0.786 | 0.897 | 0.79 |
| 1.687035254977731 | 0.786 | 0.9 | 0.79 |
| 1.690176847631321 | 0.786 | 0.903 | 0.79 |
| 1.693318440284911 | 0.786 | 0.905 | 0.791 |
| 1.6964600329385 | 0.786 | 0.908 | 0.791 |
| 1.69960162559209 | 0.786 | 0.911 | 0.792 |
| 1.70274321824568 | 0.786 | 0.914 | 0.792 |
| 1.70588481089927 | 0.786 | 0.917 | 0.793 |
| 1.70902640355286 | 0.786 | 0.92 | 0.793 |
| 1.712167996206449 | 0.786 | 0.923 | 0.794 |
| 1.715309588860039 | 0.786 | 0.926 | 0.794 |
| 1.71845118151363 | 0.786 | 0.929 | 0.795 |
| 1.721592774167219 | 0.787 | 0.932 | 0.795 |
| 1.724734366820809 | 0.787 | 0.935 | 0.796 |
| 1.727875959474399 | 0.787 | 0.937 | 0.797 |
| 1.731017552127988 | 0.787 | 0.94 | 0.797 |
| 1.734159144781578 | 0.787 | 0.943 | 0.798 |
| 1.737300737435168 | 0.787 | 0.946 | 0.799 |
| 1.740442330088758 | 0.787 | 0.949 | 0.799 |
| 1.743583922742348 | 0.787 | 0.951 | 0.8 |
| 1.746725515395937 | 0.787 | 0.954 | 0.801 |
| 1.749867108049527 | 0.787 | 0.957 | 0.802 |
| 1.753008700703117 | 0.787 | 0.96 | 0.802 |
| 1.756150293356707 | 0.788 | 0.962 | 0.803 |
| 1.759291886010297 | 0.788 | 0.965 | 0.804 |
| 1.762433478663887 | 0.788 | 0.968 | 0.805 |
| 1.765575071317476 | 0.788 | 0.971 | 0.806 |
| 1.768716663971066 | 0.788 | 0.973 | 0.807 |
| 1.771858256624656 | 0.788 | 0.976 | 0.808 |
| 1.774999849278246 | 0.788 | 0.979 | 0.809 |
| 1.778141441931836 | 0.788 | 0.981 | 0.81 |
| 1.781283034585426 | 0.788 | 0.984 | 0.811 |
| 1.784424627239015 | 0.789 | 0.986 | 0.812 |
| 1.787566219892605 | 0.789 | 0.989 | 0.813 |
| 1.790707812546195 | 0.789 | 0.992 | 0.815 |
| 1.793849405199785 | 0.789 | 0.994 | 0.816 |
| 1.796990997853375 | 0.789 | 0.997 | 0.817 |
| 1.800132590506964 | 0.789 | 0.999 | 0.818 |
| 1.803274183160554 | 0.79 | 1.002 | 0.82 |
| 1.806415775814144 | 0.79 | 1.004 | 0.821 |
| 1.809557368467734 | 0.79 | 1.007 | 0.822 |
| 1.812698961121324 | 0.79 | 1.009 | 0.824 |
| 1.815840553774914 | 0.79 | 1.012 | 0.825 |
| 1.818982146428503 | 0.79 | 1.014 | 0.826 |
| 1.822123739082093 | 0.791 | 1.017 | 0.828 |
| 1.825265331735683 | 0.791 | 1.019 | 0.829 |
| 1.828406924389273 | 0.791 | 1.021 | 0.831 |
| 1.831548517042863 | 0.791 | 1.024 | 0.832 |
| 1.834690109696452 | 0.791 | 1.026 | 0.834 |
| 1.837831702350042 | 0.792 | 1.028 | 0.836 |
| 1.840973295003632 | 0.792 | 1.031 | 0.837 |
| 1.844114887657222 | 0.792 | 1.033 | 0.839 |
| 1.847256480310812 | 0.792 | 1.035 | 0.841 |
| 1.850398072964402 | 0.793 | 1.038 | 0.842 |
| 1.853539665617991 | 0.793 | 1.04 | 0.844 |
| 1.856681258271581 | 0.793 | 1.042 | 0.846 |
| 1.859822850925171 | 0.793 | 1.044 | 0.848 |
| 1.862964443578761 | 0.794 | 1.047 | 0.85 |
| 1.866106036232351 | 0.794 | 1.049 | 0.851 |
| 1.86924762888594 | 0.794 | 1.051 | 0.853 |
| 1.87238922153953 | 0.794 | 1.053 | 0.855 |
| 1.87553081419312 | 0.795 | 1.055 | 0.857 |
| 1.87867240684671 | 0.795 | 1.057 | 0.859 |
| 1.8818139995003 | 0.795 | 1.059 | 0.861 |
| 1.88495559215389 | 0.796 | 1.061 | 0.863 |
| 1.888097184807479 | 0.796 | 1.063 | 0.865 |
| 1.891238777461069 | 0.796 | 1.065 | 0.867 |
| 1.89438037011466 | 0.796 | 1.067 | 0.87 |
| 1.897521962768249 | 0.797 | 1.069 | 0.872 |
| 1.900663555421839 | 0.797 | 1.071 | 0.874 |
| 1.903805148075429 | 0.797 | 1.073 | 0.876 |
| 1.906946740729018 | 0.798 | 1.075 | 0.878 |
| 1.910088333382608 | 0.798 | 1.077 | 0.881 |
| 1.913229926036198 | 0.798 | 1.079 | 0.883 |
| 1.916371518689788 | 0.799 | 1.081 | 0.885 |
| 1.919513111343378 | 0.799 | 1.083 | 0.888 |
| 1.922654703996967 | 0.8 | 1.085 | 0.89 |
| 1.925796296650557 | 0.8 | 1.086 | 0.892 |
| 1.928937889304147 | 0.8 | 1.088 | 0.895 |
| 1.932079481957737 | 0.801 | 1.09 | 0.897 |
| 1.935221074611327 | 0.801 | 1.092 | 0.9 |
| 1.938362667264917 | 0.802 | 1.094 | 0.902 |
| 1.941504259918506 | 0.802 | 1.095 | 0.905 |
| 1.944645852572096 | 0.802 | 1.097 | 0.907 |
| 1.947787445225686 | 0.803 | 1.099 | 0.91 |
| 1.950929037879276 | 0.803 | 1.1 | 0.912 |
| 1.954070630532866 | 0.804 | 1.102 | 0.915 |
| 1.957212223186455 | 0.804 | 1.104 | 0.918 |
| 1.960353815840045 | 0.805 | 1.105 | 0.92 |
| 1.963495408493635 | 0.805 | 1.107 | 0.923 |
| 1.966637001147225 | 0.805 | 1.108 | 0.926 |
| 1.969778593800815 | 0.806 | 1.11 | 0.928 |
| 1.972920186454405 | 0.806 | 1.111 | 0.931 |
| 1.976061779107994 | 0.807 | 1.113 | 0.934 |
| 1.979203371761584 | 0.807 | 1.114 | 0.936 |
| 1.982344964415174 | 0.808 | 1.116 | 0.939 |
| 1.985486557068764 | 0.808 | 1.117 | 0.942 |
| 1.988628149722354 | 0.809 | 1.119 | 0.945 |
| 1.991769742375943 | 0.809 | 1.12 | 0.948 |
| 1.994911335029533 | 0.81 | 1.121 | 0.951 |
| 1.998052927683123 | 0.81 | 1.123 | 0.953 |
| 2.001194520336712 | 0.811 | 1.124 | 0.956 |
| 2.004336112990302 | 0.812 | 1.126 | 0.959 |
| 2.007477705643892 | 0.812 | 1.127 | 0.962 |
| 2.010619298297482 | 0.813 | 1.128 | 0.965 |
| 2.013760890951071 | 0.813 | 1.129 | 0.968 |
| 2.016902483604661 | 0.814 | 1.131 | 0.971 |
| 2.02004407625825 | 0.814 | 1.132 | 0.974 |
| 2.02318566891184 | 0.815 | 1.133 | 0.977 |
| 2.02632726156543 | 0.816 | 1.134 | 0.98 |
| 2.029468854219019 | 0.816 | 1.135 | 0.983 |
| 2.032610446872609 | 0.817 | 1.137 | 0.986 |
| 2.035752039526198 | 0.817 | 1.138 | 0.989 |
| 2.038893632179788 | 0.818 | 1.139 | 0.992 |
| 2.042035224833378 | 0.819 | 1.14 | 0.995 |
| 2.045176817486967 | 0.819 | 1.141 | 0.998 |
| 2.048318410140557 | 0.82 | 1.142 | 1.001 |
| 2.051460002794146 | 0.821 | 1.143 | 1.004 |
| 2.054601595447736 | 0.821 | 1.144 | 1.008 |
| 2.057743188101325 | 0.822 | 1.145 | 1.011 |
| 2.060884780754915 | 0.823 | 1.146 | 1.014 |
| 2.064026373408505 | 0.823 | 1.147 | 1.017 |
| 2.067167966062094 | 0.824 | 1.148 | 1.02 |
| 2.070309558715684 | 0.825 | 1.149 | 1.023 |
| 2.073451151369273 | 0.826 | 1.15 | 1.026 |
| 2.076592744022863 | 0.826 | 1.151 | 1.029 |
| 2.079734336676452 | 0.827 | 1.152 | 1.033 |
| 2.082875929330042 | 0.828 | 1.152 | 1.036 |
| 2.086017521983632 | 0.829 | 1.153 | 1.039 |
| 2.089159114637221 | 0.829 | 1.154 | 1.042 |
| 2.092300707290811 | 0.83 | 1.155 | 1.045 |
| 2.095442299944401 | 0.831 | 1.156 | 1.048 |
| 2.09858389259799 | 0.832 | 1.156 | 1.051 |
| 2.10172548525158 | 0.833 | 1.157 | 1.055 |
| 2.104867077905169 | 0.833 | 1.158 | 1.058 |
| 2.108008670558759 | 0.834 | 1.159 | 1.061 |
| 2.111150263212349 | 0.835 | 1.159 | 1.064 |
| 2.114291855865938 | 0.836 | 1.16 | 1.067 |
| 2.117433448519528 | 0.837 | 1.161 | 1.07 |
| 2.120575041173117 | 0.838 | 1.161 | 1.073 |
| 2.123716633826707 | 0.838 | 1.162 | 1.076 |
| 2.126858226480297 | 0.839 | 1.163 | 1.08 |
| 2.129999819133886 | 0.84 | 1.163 | 1.083 |
| 2.133141411787476 | 0.841 | 1.164 | 1.086 |
| 2.136283004441065 | 0.842 | 1.164 | 1.089 |
| 2.139424597094655 | 0.843 | 1.165 | 1.092 |
| 2.142566189748245 | 0.844 | 1.166 | 1.095 |
| 2.145707782401834 | 0.845 | 1.166 | 1.098 |
| 2.148849375055424 | 0.846 | 1.167 | 1.101 |
| 2.151990967709013 | 0.847 | 1.167 | 1.104 |
| 2.155132560362603 | 0.848 | 1.168 | 1.107 |
| 2.158274153016193 | 0.848 | 1.168 | 1.11 |
| 2.161415745669782 | 0.849 | 1.169 | 1.113 |
| 2.164557338323372 | 0.85 | 1.169 | 1.116 |
| 2.167698930976961 | 0.851 | 1.169 | 1.119 |
| 2.170840523630551 | 0.852 | 1.17 | 1.122 |
| 2.173982116284141 | 0.853 | 1.17 | 1.125 |
| 2.17712370893773 | 0.854 | 1.171 | 1.128 |
| 2.18026530159132 | 0.855 | 1.171 | 1.131 |
| 2.183406894244909 | 0.856 | 1.171 | 1.134 |
| 2.186548486898499 | 0.858 | 1.172 | 1.137 |
| 2.189690079552089 | 0.859 | 1.172 | 1.14 |
| 2.192831672205678 | 0.86 | 1.172 | 1.143 |
| 2.195973264859268 | 0.861 | 1.173 | 1.146 |
| 2.199114857512857 | 0.862 | 1.173 | 1.149 |
| 2.202256450166447 | 0.863 | 1.173 | 1.151 |
| 2.205398042820036 | 0.864 | 1.174 | 1.154 |
| 2.208539635473626 | 0.865 | 1.174 | 1.157 |
| 2.211681228127216 | 0.866 | 1.174 | 1.16 |
| 2.214822820780805 | 0.867 | 1.174 | 1.163 |
| 2.217964413434395 | 0.868 | 1.175 | 1.165 |
| 2.221106006087984 | 0.87 | 1.175 | 1.168 |
| 2.224247598741574 | 0.871 | 1.175 | 1.171 |
| 2.227389191395164 | 0.872 | 1.175 | 1.173 |
| 2.230530784048753 | 0.873 | 1.175 | 1.176 |
| 2.233672376702343 | 0.874 | 1.176 | 1.179 |
| 2.236813969355933 | 0.875 | 1.176 | 1.181 |
| 2.239955562009522 | 0.877 | 1.176 | 1.184 |
| 2.243097154663112 | 0.878 | 1.176 | 1.186 |
| 2.246238747316701 | 0.879 | 1.176 | 1.189 |
| 2.249380339970291 | 0.88 | 1.176 | 1.191 |
| 2.252521932623881 | 0.882 | 1.177 | 1.194 |
| 2.25566352527747 | 0.883 | 1.177 | 1.196 |
| 2.25880511793106 | 0.884 | 1.177 | 1.199 |
| 2.261946710584649 | 0.885 | 1.177 | 1.201 |
| 2.265088303238239 | 0.887 | 1.177 | 1.204 |
| 2.268229895891829 | 0.888 | 1.177 | 1.206 |
| 2.271371488545418 | 0.889 | 1.177 | 1.208 |
| 2.274513081199008 | 0.891 | 1.177 | 1.211 |
| 2.277654673852597 | 0.892 | 1.177 | 1.213 |
| 2.280796266506186 | 0.893 | 1.178 | 1.215 |
| 2.283937859159776 | 0.895 | 1.178 | 1.218 |
| 2.287079451813366 | 0.896 | 1.178 | 1.22 |
| 2.290221044466955 | 0.897 | 1.178 | 1.222 |
| 2.293362637120545 | 0.899 | 1.178 | 1.224 |
| 2.296504229774135 | 0.9 | 1.178 | 1.226 |
| 2.299645822427724 | 0.901 | 1.178 | 1.228 |
| 2.302787415081314 | 0.903 | 1.178 | 1.23 |
| 2.305929007734904 | 0.904 | 1.178 | 1.233 |
| 2.309070600388493 | 0.906 | 1.178 | 1.235 |
| 2.312212193042083 | 0.907 | 1.178 | 1.237 |
| 2.315353785695672 | 0.909 | 1.178 | 1.239 |
| 2.318495378349262 | 0.91 | 1.178 | 1.24 |
| 2.321636971002852 | 0.911 | 1.178 | 1.242 |
| 2.324778563656441 | 0.913 | 1.178 | 1.244 |
| 2.327920156310031 | 0.914 | 1.178 | 1.246 |
| 2.33106174896362 | 0.916 | 1.178 | 1.248 |
| 2.33420334161721 | 0.917 | 1.178 | 1.25 |
| 2.3373449342708 | 0.919 | 1.178 | 1.251 |
| 2.340486526924389 | 0.92 | 1.178 | 1.253 |
| 2.343628119577979 | 0.922 | 1.178 | 1.255 |
| 2.346769712231568 | 0.923 | 1.178 | 1.257 |
| 2.349911304885158 | 0.925 | 1.178 | 1.258 |
| 2.353052897538748 | 0.927 | 1.178 | 1.26 |
| 2.356194490192337 | 0.928 | 1.178 | 1.261 |
| 2.359336082845927 | 0.93 | 1.178 | 1.263 |
| 2.362477675499516 | 0.931 | 1.178 | 1.265 |
| 2.365619268153106 | 0.933 | 1.178 | 1.266 |
| 2.368760860806696 | 0.934 | 1.178 | 1.267 |
| 2.371902453460285 | 0.936 | 1.178 | 1.269 |
| 2.375044046113875 | 0.938 | 1.178 | 1.27 |
| 2.378185638767464 | 0.939 | 1.178 | 1.272 |
| 2.381327231421054 | 0.941 | 1.178 | 1.273 |
| 2.384468824074644 | 0.943 | 1.178 | 1.274 |
| 2.387610416728233 | 0.944 | 1.178 | 1.276 |
| 2.390752009381823 | 0.946 | 1.178 | 1.277 |
| 2.393893602035412 | 0.948 | 1.178 | 1.278 |
| 2.397035194689002 | 0.949 | 1.178 | 1.279 |
| 2.400176787342591 | 0.951 | 1.178 | 1.281 |
| 2.403318379996181 | 0.953 | 1.178 | 1.282 |
| 2.406459972649771 | 0.954 | 1.178 | 1.283 |
| 2.40960156530336 | 0.956 | 1.178 | 1.284 |
| 2.41274315795695 | 0.958 | 1.178 | 1.285 |
| 2.41588475061054 | 0.96 | 1.178 | 1.286 |
| 2.419026343264129 | 0.961 | 1.178 | 1.287 |
| 2.422167935917719 | 0.963 | 1.178 | 1.288 |
| 2.425309528571308 | 0.965 | 1.179 | 1.289 |
| 2.428451121224898 | 0.967 | 1.179 | 1.29 |
| 2.431592713878488 | 0.969 | 1.179 | 1.291 |
| 2.434734306532077 | 0.97 | 1.179 | 1.292 |
| 2.437875899185667 | 0.972 | 1.179 | 1.292 |
| 2.441017491839256 | 0.974 | 1.179 | 1.293 |
| 2.444159084492846 | 0.976 | 1.179 | 1.294 |
| 2.447300677146435 | 0.978 | 1.179 | 1.295 |
| 2.450442269800025 | 0.98 | 1.179 | 1.296 |
| 2.453583862453615 | 0.982 | 1.179 | 1.296 |
| 2.456725455107204 | 0.983 | 1.179 | 1.297 |
| 2.459867047760794 | 0.985 | 1.18 | 1.298 |
| 2.463008640414384 | 0.987 | 1.18 | 1.298 |
| 2.466150233067973 | 0.989 | 1.18 | 1.299 |
| 2.469291825721563 | 0.991 | 1.18 | 1.3 |
| 2.472433418375152 | 0.993 | 1.18 | 1.3 |
| 2.475575011028742 | 0.995 | 1.18 | 1.301 |
| 2.478716603682332 | 0.997 | 1.181 | 1.301 |
| 2.481858196335921 | 0.999 | 1.181 | 1.302 |
| 2.48499978898951 | 1.001 | 1.181 | 1.302 |
| 2.4881413816431 | 1.003 | 1.181 | 1.303 |
| 2.49128297429669 | 1.005 | 1.181 | 1.303 |
| 2.49442456695028 | 1.007 | 1.182 | 1.303 |
| 2.497566159603869 | 1.009 | 1.182 | 1.304 |
| 2.500707752257458 | 1.011 | 1.182 | 1.304 |
| 2.503849344911048 | 1.013 | 1.182 | 1.305 |
| 2.506990937564638 | 1.015 | 1.183 | 1.305 |
| 2.510132530218228 | 1.017 | 1.183 | 1.305 |
| 2.513274122871817 | 1.019 | 1.183 | 1.306 |
| 2.516415715525407 | 1.021 | 1.183 | 1.306 |
| 2.519557308178996 | 1.023 | 1.184 | 1.306 |
| 2.522698900832586 | 1.025 | 1.184 | 1.306 |
| 2.525840493486176 | 1.027 | 1.184 | 1.307 |
| 2.528982086139765 | 1.029 | 1.185 | 1.307 |
| 2.532123678793355 | 1.031 | 1.185 | 1.307 |
| 2.535265271446944 | 1.033 | 1.186 | 1.307 |
| 2.538406864100534 | 1.036 | 1.186 | 1.308 |
| 2.541548456754124 | 1.038 | 1.186 | 1.308 |
| 2.544690049407713 | 1.04 | 1.187 | 1.308 |
| 2.547831642061302 | 1.042 | 1.187 | 1.308 |
| 2.550973234714892 | 1.044 | 1.188 | 1.308 |
| 2.554114827368482 | 1.046 | 1.188 | 1.308 |
| 2.557256420022072 | 1.049 | 1.189 | 1.308 |
| 2.560398012675661 | 1.051 | 1.189 | 1.308 |
| 2.563539605329251 | 1.053 | 1.19 | 1.309 |
| 2.56668119798284 | 1.055 | 1.19 | 1.309 |
| 2.56982279063643 | 1.057 | 1.191 | 1.309 |
| 2.57296438329002 | 1.06 | 1.191 | 1.309 |
| 2.576105975943609 | 1.062 | 1.192 | 1.309 |
| 2.579247568597199 | 1.064 | 1.192 | 1.309 |
| 2.582389161250788 | 1.066 | 1.193 | 1.309 |
| 2.585530753904377 | 1.069 | 1.194 | 1.309 |
| 2.588672346557967 | 1.071 | 1.194 | 1.309 |
| 2.591813939211557 | 1.073 | 1.195 | 1.309 |
| 2.594955531865147 | 1.075 | 1.195 | 1.309 |
| 2.598097124518736 | 1.078 | 1.196 | 1.309 |
| 2.601238717172326 | 1.08 | 1.197 | 1.309 |
| 2.604380309825915 | 1.082 | 1.197 | 1.309 |
| 2.607521902479505 | 1.085 | 1.198 | 1.309 |
| 2.610663495133095 | 1.087 | 1.199 | 1.309 |
| 2.613805087786684 | 1.089 | 1.2 | 1.309 |
| 2.616946680440274 | 1.092 | 1.2 | 1.309 |
| 2.620088273093863 | 1.094 | 1.201 | 1.309 |
| 2.623229865747452 | 1.096 | 1.202 | 1.309 |
| 2.626371458401042 | 1.099 | 1.203 | 1.309 |
| 2.629513051054632 | 1.101 | 1.204 | 1.309 |
| 2.632654643708222 | 1.104 | 1.205 | 1.309 |
| 2.635796236361811 | 1.106 | 1.205 | 1.309 |
| 2.638937829015401 | 1.108 | 1.206 | 1.309 |
| 2.642079421668991 | 1.111 | 1.207 | 1.309 |
| 2.64522101432258 | 1.113 | 1.208 | 1.309 |
| 2.64836260697617 | 1.116 | 1.209 | 1.309 |
| 2.651504199629759 | 1.118 | 1.21 | 1.309 |
| 2.654645792283349 | 1.121 | 1.211 | 1.309 |
| 2.657787384936938 | 1.123 | 1.212 | 1.309 |
| 2.660928977590528 | 1.125 | 1.213 | 1.309 |
| 2.664070570244118 | 1.128 | 1.214 | 1.309 |
| 2.667212162897707 | 1.13 | 1.215 | 1.309 |
| 2.670353755551297 | 1.133 | 1.216 | 1.309 |
| 2.673495348204887 | 1.135 | 1.217 | 1.31 |
| 2.676636940858476 | 1.138 | 1.219 | 1.31 |
| 2.679778533512066 | 1.14 | 1.22 | 1.31 |
| 2.682920126165655 | 1.143 | 1.221 | 1.31 |
| 2.686061718819245 | 1.145 | 1.222 | 1.31 |
| 2.689203311472835 | 1.148 | 1.223 | 1.31 |
| 2.692344904126424 | 1.151 | 1.224 | 1.31 |
| 2.695486496780014 | 1.153 | 1.226 | 1.31 |
| 2.698628089433603 | 1.156 | 1.227 | 1.311 |
| 2.701769682087193 | 1.158 | 1.228 | 1.311 |
| 2.704911274740782 | 1.161 | 1.229 | 1.311 |
| 2.708052867394372 | 1.163 | 1.231 | 1.311 |
| 2.711194460047962 | 1.166 | 1.232 | 1.311 |
| 2.714336052701551 | 1.169 | 1.233 | 1.312 |
| 2.717477645355141 | 1.171 | 1.235 | 1.312 |
| 2.720619238008731 | 1.174 | 1.236 | 1.312 |
| 2.72376083066232 | 1.176 | 1.238 | 1.312 |
| 2.72690242331591 | 1.179 | 1.239 | 1.313 |
| 2.730044015969499 | 1.182 | 1.24 | 1.313 |
| 2.733185608623089 | 1.184 | 1.242 | 1.313 |
| 2.736327201276678 | 1.187 | 1.243 | 1.314 |
| 2.739468793930268 | 1.19 | 1.245 | 1.314 |
| 2.742610386583858 | 1.192 | 1.246 | 1.315 |
| 2.745751979237447 | 1.195 | 1.248 | 1.315 |
| 2.748893571891036 | 1.198 | 1.249 | 1.316 |
| 2.752035164544627 | 1.2 | 1.251 | 1.316 |
| 2.755176757198216 | 1.203 | 1.253 | 1.316 |
| 2.758318349851806 | 1.206 | 1.254 | 1.317 |
| 2.761459942505395 | 1.208 | 1.256 | 1.318 |
| 2.764601535158985 | 1.211 | 1.258 | 1.318 |
| 2.767743127812574 | 1.214 | 1.259 | 1.319 |
| 2.770884720466164 | 1.217 | 1.261 | 1.319 |
| 2.774026313119754 | 1.219 | 1.263 | 1.32 |
| 2.777167905773343 | 1.222 | 1.264 | 1.321 |
| 2.780309498426932 | 1.225 | 1.266 | 1.321 |
| 2.783451091080522 | 1.228 | 1.268 | 1.322 |
| 2.786592683734112 | 1.23 | 1.27 | 1.323 |
| 2.789734276387701 | 1.233 | 1.272 | 1.323 |
| 2.792875869041291 | 1.236 | 1.273 | 1.324 |
| 2.796017461694881 | 1.239 | 1.275 | 1.325 |
| 2.79915905434847 | 1.241 | 1.277 | 1.326 |
| 2.80230064700206 | 1.244 | 1.279 | 1.327 |
| 2.80544223965565 | 1.247 | 1.281 | 1.328 |
| 2.808583832309239 | 1.25 | 1.283 | 1.328 |
| 2.811725424962829 | 1.253 | 1.285 | 1.329 |
| 2.814867017616419 | 1.255 | 1.287 | 1.33 |
| 2.818008610270008 | 1.258 | 1.289 | 1.331 |
| 2.821150202923598 | 1.261 | 1.291 | 1.332 |
| 2.824291795577187 | 1.264 | 1.293 | 1.333 |
| 2.827433388230777 | 1.267 | 1.295 | 1.334 |
| 2.830574980884366 | 1.27 | 1.297 | 1.336 |
| 2.833716573537956 | 1.272 | 1.299 | 1.337 |
| 2.836858166191546 | 1.275 | 1.301 | 1.338 |
| 2.839999758845135 | 1.278 | 1.303 | 1.339 |
| 2.843141351498725 | 1.281 | 1.305 | 1.34 |
| 2.846282944152314 | 1.284 | 1.308 | 1.341 |
| 2.849424536805904 | 1.287 | 1.31 | 1.343 |
| 2.852566129459494 | 1.29 | 1.312 | 1.344 |
| 2.855707722113083 | 1.293 | 1.314 | 1.345 |
| 2.858849314766673 | 1.295 | 1.316 | 1.347 |
| 2.861990907420262 | 1.298 | 1.319 | 1.348 |
| 2.865132500073852 | 1.301 | 1.321 | 1.35 |
| 2.868274092727442 | 1.304 | 1.323 | 1.351 |
| 2.871415685381031 | 1.307 | 1.325 | 1.352 |
| 2.874557278034621 | 1.31 | 1.328 | 1.354 |
| 2.87769887068821 | 1.313 | 1.33 | 1.356 |
| 2.8808404633418 | 1.316 | 1.332 | 1.357 |
| 2.88398205599539 | 1.319 | 1.335 | 1.359 |
| 2.88712364864898 | 1.322 | 1.337 | 1.36 |
| 2.890265241302569 | 1.325 | 1.34 | 1.362 |
| 2.893406833956158 | 1.328 | 1.342 | 1.364 |
| 2.896548426609748 | 1.331 | 1.344 | 1.365 |
| 2.899690019263338 | 1.334 | 1.347 | 1.367 |
| 2.902831611916927 | 1.337 | 1.349 | 1.369 |
| 2.905973204570517 | 1.339 | 1.352 | 1.371 |
| 2.909114797224106 | 1.342 | 1.354 | 1.373 |
| 2.912256389877696 | 1.345 | 1.357 | 1.374 |
| 2.915397982531286 | 1.348 | 1.359 | 1.376 |
| 2.918539575184875 | 1.351 | 1.362 | 1.378 |
| 2.921681167838465 | 1.354 | 1.365 | 1.38 |
| 2.924822760492054 | 1.357 | 1.367 | 1.382 |
| 2.927964353145644 | 1.36 | 1.37 | 1.384 |
| 2.931105945799234 | 1.363 | 1.372 | 1.386 |
| 2.934247538452823 | 1.366 | 1.375 | 1.388 |
| 2.937389131106413 | 1.369 | 1.378 | 1.39 |
| 2.940530723760002 | 1.372 | 1.38 | 1.392 |
| 2.943672316413592 | 1.375 | 1.383 | 1.395 |
| 2.946813909067182 | 1.378 | 1.386 | 1.397 |
| 2.949955501720771 | 1.381 | 1.388 | 1.399 |
| 2.953097094374361 | 1.385 | 1.391 | 1.401 |
| 2.95623868702795 | 1.388 | 1.394 | 1.403 |
| 2.95938027968154 | 1.391 | 1.396 | 1.406 |
| 2.96252187233513 | 1.394 | 1.399 | 1.408 |
| 2.965663464988719 | 1.397 | 1.402 | 1.41 |
| 2.968805057642309 | 1.4 | 1.405 | 1.413 |
| 2.971946650295898 | 1.403 | 1.408 | 1.415 |
| 2.975088242949488 | 1.406 | 1.41 | 1.417 |
| 2.978229835603078 | 1.409 | 1.413 | 1.42 |
| 2.981371428256667 | 1.412 | 1.416 | 1.422 |
| 2.984513020910257 | 1.415 | 1.419 | 1.425 |
| 2.987654613563846 | 1.418 | 1.422 | 1.427 |
| 2.990796206217436 | 1.421 | 1.424 | 1.43 |
| 2.993937798871025 | 1.424 | 1.427 | 1.432 |
| 2.997079391524615 | 1.427 | 1.43 | 1.435 |
| 3.000220984178205 | 1.43 | 1.433 | 1.438 |
| 3.003362576831794 | 1.433 | 1.436 | 1.44 |
| 3.006504169485384 | 1.437 | 1.439 | 1.443 |
| 3.009645762138974 | 1.44 | 1.442 | 1.446 |
| 3.012787354792563 | 1.443 | 1.445 | 1.448 |
| 3.015928947446153 | 1.446 | 1.448 | 1.451 |
| 3.019070540099742 | 1.449 | 1.451 | 1.454 |
| 3.022212132753332 | 1.452 | 1.454 | 1.456 |
| 3.025353725406922 | 1.455 | 1.457 | 1.459 |
| 3.028495318060511 | 1.458 | 1.46 | 1.462 |
| 3.031636910714101 | 1.461 | 1.463 | 1.465 |
| 3.03477850336769 | 1.464 | 1.466 | 1.468 |
| 3.03792009602128 | 1.467 | 1.469 | 1.47 |
| 3.04106168867487 | 1.471 | 1.472 | 1.473 |
| 3.04420328132846 | 1.474 | 1.475 | 1.476 |
| 3.047344873982049 | 1.477 | 1.478 | 1.479 |
| 3.050486466635638 | 1.48 | 1.481 | 1.482 |
| 3.053628059289228 | 1.483 | 1.484 | 1.485 |
| 3.056769651942818 | 1.486 | 1.487 | 1.488 |
| 3.059911244596407 | 1.489 | 1.49 | 1.491 |
| 3.063052837249997 | 1.492 | 1.493 | 1.494 |
| 3.066194429903586 | 1.496 | 1.496 | 1.497 |
| 3.069336022557176 | 1.499 | 1.499 | 1.5 |
| 3.072477615210766 | 1.502 | 1.502 | 1.503 |
| 3.075619207864355 | 1.505 | 1.505 | 1.506 |
| 3.078760800517945 | 1.508 | 1.508 | 1.509 |
| 3.081902393171534 | 1.511 | 1.511 | 1.512 |
| 3.085043985825124 | 1.514 | 1.514 | 1.515 |
| 3.088185578478713 | 1.517 | 1.518 | 1.518 |
| 3.091327171132303 | 1.521 | 1.521 | 1.521 |
| 3.094468763785893 | 1.524 | 1.524 | 1.524 |
| 3.097610356439482 | 1.527 | 1.527 | 1.527 |
| 3.100751949093072 | 1.53 | 1.53 | 1.53 |
| 3.103893541746661 | 1.533 | 1.533 | 1.533 |
| 3.107035134400251 | 1.536 | 1.536 | 1.536 |
| 3.110176727053841 | 1.539 | 1.539 | 1.539 |
| 3.11331831970743 | 1.543 | 1.543 | 1.543 |
| 3.11645991236102 | 1.546 | 1.546 | 1.546 |
| 3.11960150501461 | 1.549 | 1.549 | 1.549 |
| 3.122743097668199 | 1.552 | 1.552 | 1.552 |
| 3.125884690321789 | 1.555 | 1.555 | 1.555 |
| 3.129026282975378 | 1.558 | 1.558 | 1.558 |
| 3.132167875628968 | 1.561 | 1.561 | 1.561 |
| 3.135309468282557 | 1.565 | 1.565 | 1.565 |
| 3.138451060936147 | 1.568 | 1.568 | 1.568 |
| 3.141592653589737 | 1.571 | 1.571 | 1.571 |
| 3.144734246243326 | 1.574 | 1.574 | 1.574 |
| 3.147875838896916 | 1.577 | 1.577 | 1.577 |
| 3.151017431550505 | 1.58 | 1.58 | 1.58 |
| 3.154159024204095 | 1.583 | 1.583 | 1.583 |
| 3.157300616857685 | 1.587 | 1.586 | 1.586 |
| 3.160442209511274 | 1.59 | 1.59 | 1.59 |
| 3.163583802164864 | 1.593 | 1.593 | 1.593 |
| 3.166725394818453 | 1.596 | 1.596 | 1.596 |
| 3.169866987472043 | 1.599 | 1.599 | 1.599 |
| 3.173008580125633 | 1.602 | 1.602 | 1.602 |
| 3.176150172779222 | 1.605 | 1.605 | 1.605 |
| 3.179291765432812 | 1.608 | 1.608 | 1.608 |
| 3.182433358086401 | 1.612 | 1.612 | 1.611 |
| 3.185574950739991 | 1.615 | 1.615 | 1.615 |
| 3.188716543393581 | 1.618 | 1.618 | 1.618 |
| 3.19185813604717 | 1.621 | 1.621 | 1.621 |
| 3.19499972870076 | 1.624 | 1.624 | 1.624 |
| 3.198141321354349 | 1.627 | 1.627 | 1.627 |
| 3.20128291400794 | 1.63 | 1.63 | 1.63 |
| 3.204424506661528 | 1.634 | 1.633 | 1.633 |
| 3.207566099315118 | 1.637 | 1.636 | 1.636 |
| 3.210707691968708 | 1.64 | 1.639 | 1.639 |
| 3.213849284622297 | 1.643 | 1.643 | 1.642 |
| 3.216990877275887 | 1.646 | 1.646 | 1.645 |
| 3.220132469929476 | 1.649 | 1.649 | 1.648 |
| 3.223274062583066 | 1.652 | 1.652 | 1.651 |
| 3.226415655236656 | 1.655 | 1.655 | 1.654 |
| 3.229557247890245 | 1.659 | 1.658 | 1.657 |
| 3.232698840543835 | 1.662 | 1.661 | 1.66 |
| 3.235840433197425 | 1.665 | 1.664 | 1.663 |
| 3.238982025851014 | 1.668 | 1.667 | 1.665 |
| 3.242123618504604 | 1.671 | 1.67 | 1.668 |
| 3.245265211158193 | 1.674 | 1.673 | 1.671 |
| 3.248406803811783 | 1.677 | 1.676 | 1.674 |
| 3.251548396465373 | 1.68 | 1.679 | 1.677 |
| 3.254689989118962 | 1.683 | 1.682 | 1.68 |
| 3.257831581772551 | 1.687 | 1.685 | 1.682 |
| 3.260973174426141 | 1.69 | 1.688 | 1.685 |
| 3.26411476707973 | 1.693 | 1.691 | 1.688 |
| 3.267256359733321 | 1.696 | 1.694 | 1.691 |
| 3.27039795238691 | 1.699 | 1.697 | 1.693 |
| 3.2735395450405 | 1.702 | 1.7 | 1.696 |
| 3.276681137694089 | 1.705 | 1.703 | 1.699 |
| 3.279822730347679 | 1.708 | 1.706 | 1.701 |
| 3.282964323001269 | 1.711 | 1.708 | 1.704 |
| 3.286105915654858 | 1.714 | 1.711 | 1.707 |
| 3.289247508308448 | 1.717 | 1.714 | 1.709 |
| 3.292389100962037 | 1.72 | 1.717 | 1.712 |
| 3.295530693615627 | 1.724 | 1.72 | 1.714 |
| 3.298672286269217 | 1.727 | 1.723 | 1.717 |
| 3.301813878922806 | 1.73 | 1.726 | 1.719 |
| 3.304955471576396 | 1.733 | 1.728 | 1.722 |
| 3.308097064229985 | 1.736 | 1.731 | 1.724 |
| 3.311238656883575 | 1.739 | 1.734 | 1.727 |
| 3.314380249537165 | 1.742 | 1.737 | 1.729 |
| 3.317521842190754 | 1.745 | 1.74 | 1.731 |
| 3.320663434844344 | 1.748 | 1.742 | 1.734 |
| 3.323805027497933 | 1.751 | 1.745 | 1.736 |
| 3.326946620151523 | 1.754 | 1.748 | 1.738 |
| 3.330088212805113 | 1.757 | 1.751 | 1.74 |
| 3.333229805458702 | 1.76 | 1.753 | 1.743 |
| 3.336371398112292 | 1.763 | 1.756 | 1.745 |
| 3.339512990765881 | 1.766 | 1.759 | 1.747 |
| 3.342654583419471 | 1.769 | 1.761 | 1.749 |
| 3.345796176073061 | 1.772 | 1.764 | 1.751 |
| 3.34893776872665 | 1.775 | 1.767 | 1.753 |
| 3.35207936138024 | 1.778 | 1.769 | 1.755 |
| 3.355220954033829 | 1.781 | 1.772 | 1.757 |
| 3.358362546687419 | 1.784 | 1.774 | 1.759 |
| 3.361504139341009 | 1.787 | 1.777 | 1.761 |
| 3.364645731994598 | 1.79 | 1.78 | 1.763 |
| 3.367787324648188 | 1.793 | 1.782 | 1.765 |
| 3.370928917301777 | 1.796 | 1.785 | 1.767 |
| 3.374070509955367 | 1.799 | 1.787 | 1.769 |
| 3.377212102608956 | 1.802 | 1.79 | 1.771 |
| 3.380353695262546 | 1.805 | 1.792 | 1.773 |
| 3.383495287916136 | 1.808 | 1.795 | 1.774 |
| 3.386636880569725 | 1.811 | 1.797 | 1.776 |
| 3.389778473223315 | 1.814 | 1.8 | 1.778 |
| 3.392920065876904 | 1.817 | 1.802 | 1.78 |
| 3.396061658530494 | 1.82 | 1.804 | 1.781 |
| 3.399203251184084 | 1.823 | 1.807 | 1.783 |
| 3.402344843837673 | 1.826 | 1.809 | 1.785 |
| 3.405486436491263 | 1.829 | 1.812 | 1.786 |
| 3.408628029144852 | 1.832 | 1.814 | 1.788 |
| 3.411769621798442 | 1.834 | 1.816 | 1.789 |
| 3.414911214452032 | 1.837 | 1.818 | 1.791 |
| 3.418052807105621 | 1.84 | 1.821 | 1.792 |
| 3.421194399759211 | 1.843 | 1.823 | 1.793 |
| 3.4243359924128 | 1.846 | 1.825 | 1.795 |
| 3.42747758506639 | 1.849 | 1.828 | 1.796 |
| 3.43061917771998 | 1.852 | 1.83 | 1.798 |
| 3.433760770373569 | 1.855 | 1.832 | 1.799 |
| 3.436902363027159 | 1.858 | 1.834 | 1.8 |
| 3.440043955680748 | 1.861 | 1.836 | 1.801 |
| 3.443185548334338 | 1.863 | 1.838 | 1.803 |
| 3.446327140987927 | 1.866 | 1.841 | 1.804 |
| 3.449468733641517 | 1.869 | 1.843 | 1.805 |
| 3.452610326295107 | 1.872 | 1.845 | 1.806 |
| 3.455751918948696 | 1.875 | 1.847 | 1.807 |
| 3.458893511602286 | 1.878 | 1.849 | 1.808 |
| 3.462035104255876 | 1.88 | 1.851 | 1.809 |
| 3.465176696909465 | 1.883 | 1.853 | 1.81 |
| 3.468318289563055 | 1.886 | 1.855 | 1.811 |
| 3.471459882216644 | 1.889 | 1.857 | 1.812 |
| 3.474601474870234 | 1.892 | 1.859 | 1.813 |
| 3.477743067523824 | 1.895 | 1.861 | 1.814 |
| 3.480884660177413 | 1.897 | 1.863 | 1.815 |
| 3.484026252831002 | 1.9 | 1.864 | 1.816 |
| 3.487167845484592 | 1.903 | 1.866 | 1.817 |
| 3.490309438138182 | 1.906 | 1.868 | 1.817 |
| 3.493451030791772 | 1.908 | 1.87 | 1.818 |
| 3.496592623445361 | 1.911 | 1.872 | 1.819 |
| 3.499734216098951 | 1.914 | 1.874 | 1.82 |
| 3.50287580875254 | 1.917 | 1.875 | 1.82 |
| 3.50601740140613 | 1.92 | 1.877 | 1.821 |
| 3.50915899405972 | 1.922 | 1.879 | 1.822 |
| 3.512300586713309 | 1.925 | 1.881 | 1.822 |
| 3.515442179366899 | 1.928 | 1.882 | 1.823 |
| 3.518583772020488 | 1.93 | 1.884 | 1.824 |
| 3.521725364674078 | 1.933 | 1.886 | 1.824 |
| 3.524866957327668 | 1.936 | 1.887 | 1.825 |
| 3.528008549981257 | 1.939 | 1.889 | 1.825 |
| 3.531150142634847 | 1.941 | 1.891 | 1.826 |
| 3.534291735288436 | 1.944 | 1.892 | 1.826 |
| 3.537433327942026 | 1.947 | 1.894 | 1.827 |
| 3.540574920595616 | 1.949 | 1.895 | 1.827 |
| 3.543716513249205 | 1.952 | 1.897 | 1.827 |
| 3.546858105902795 | 1.955 | 1.898 | 1.828 |
| 3.549999698556384 | 1.957 | 1.9 | 1.828 |
| 3.553141291209974 | 1.96 | 1.901 | 1.828 |
| 3.556282883863564 | 1.963 | 1.903 | 1.829 |
| 3.559424476517153 | 1.965 | 1.904 | 1.829 |
| 3.562566069170743 | 1.968 | 1.905 | 1.829 |
| 3.565707661824332 | 1.97 | 1.907 | 1.83 |
| 3.568849254477922 | 1.973 | 1.908 | 1.83 |
| 3.571990847131511 | 1.976 | 1.91 | 1.83 |
| 3.575132439785101 | 1.978 | 1.911 | 1.83 |
| 3.578274032438691 | 1.981 | 1.912 | 1.831 |
| 3.58141562509228 | 1.983 | 1.913 | 1.831 |
| 3.58455721774587 | 1.986 | 1.915 | 1.831 |
| 3.58769881039946 | 1.988 | 1.916 | 1.831 |
| 3.590840403053049 | 1.991 | 1.917 | 1.831 |
| 3.593981995706639 | 1.994 | 1.918 | 1.832 |
| 3.597123588360228 | 1.996 | 1.92 | 1.832 |
| 3.600265181013818 | 1.999 | 1.921 | 1.832 |
| 3.603406773667407 | 2.001 | 1.922 | 1.832 |
| 3.606548366320997 | 2.004 | 1.923 | 1.832 |
| 3.609689958974587 | 2.006 | 1.924 | 1.832 |
| 3.612831551628176 | 2.009 | 1.925 | 1.832 |
| 3.615973144281766 | 2.011 | 1.926 | 1.832 |
| 3.619114736935355 | 2.014 | 1.927 | 1.832 |
| 3.622256329588945 | 2.016 | 1.928 | 1.832 |
| 3.625397922242534 | 2.019 | 1.929 | 1.832 |
| 3.628539514896124 | 2.021 | 1.93 | 1.832 |
| 3.631681107549714 | 2.023 | 1.931 | 1.832 |
| 3.634822700203303 | 2.026 | 1.932 | 1.833 |
| 3.637964292856893 | 2.028 | 1.933 | 1.833 |
| 3.641105885510483 | 2.031 | 1.934 | 1.833 |
| 3.644247478164072 | 2.033 | 1.935 | 1.833 |
| 3.647389070817662 | 2.036 | 1.936 | 1.833 |
| 3.650530663471251 | 2.038 | 1.937 | 1.833 |
| 3.653672256124841 | 2.04 | 1.938 | 1.833 |
| 3.656813848778431 | 2.043 | 1.939 | 1.833 |
| 3.65995544143202 | 2.045 | 1.94 | 1.833 |
| 3.66309703408561 | 2.048 | 1.94 | 1.833 |
| 3.666238626739199 | 2.05 | 1.941 | 1.833 |
| 3.66938021939279 | 2.052 | 1.942 | 1.833 |
| 3.672521812046378 | 2.055 | 1.943 | 1.833 |
| 3.675663404699968 | 2.057 | 1.943 | 1.833 |
| 3.678804997353558 | 2.059 | 1.944 | 1.833 |
| 3.681946590007147 | 2.062 | 1.945 | 1.833 |
| 3.685088182660737 | 2.064 | 1.945 | 1.833 |
| 3.688229775314326 | 2.066 | 1.946 | 1.833 |
| 3.691371367967916 | 2.068 | 1.947 | 1.833 |
| 3.694512960621506 | 2.071 | 1.947 | 1.833 |
| 3.697654553275095 | 2.073 | 1.948 | 1.833 |
| 3.700796145928685 | 2.075 | 1.949 | 1.833 |
| 3.703937738582274 | 2.078 | 1.949 | 1.833 |
| 3.707079331235864 | 2.08 | 1.95 | 1.833 |
| 3.710220923889454 | 2.082 | 1.95 | 1.833 |
| 3.713362516543043 | 2.084 | 1.951 | 1.833 |
| 3.716504109196633 | 2.086 | 1.951 | 1.833 |
| 3.719645701850223 | 2.089 | 1.952 | 1.833 |
| 3.722787294503812 | 2.091 | 1.953 | 1.833 |
| 3.725928887157402 | 2.093 | 1.953 | 1.833 |
| 3.729070479810991 | 2.095 | 1.953 | 1.833 |
| 3.732212072464581 | 2.097 | 1.954 | 1.833 |
| 3.735353665118171 | 2.1 | 1.954 | 1.834 |
| 3.73849525777176 | 2.102 | 1.955 | 1.834 |
| 3.74163685042535 | 2.104 | 1.955 | 1.834 |
| 3.744778443078939 | 2.106 | 1.956 | 1.834 |
| 3.747920035732529 | 2.108 | 1.956 | 1.834 |
| 3.751061628386119 | 2.11 | 1.956 | 1.834 |
| 3.754203221039708 | 2.112 | 1.957 | 1.835 |
| 3.757344813693298 | 2.114 | 1.957 | 1.835 |
| 3.760486406346887 | 2.117 | 1.957 | 1.835 |
| 3.763627999000477 | 2.119 | 1.958 | 1.835 |
| 3.766769591654067 | 2.121 | 1.958 | 1.836 |
| 3.769911184307656 | 2.123 | 1.958 | 1.836 |
| 3.773052776961246 | 2.125 | 1.959 | 1.836 |
| 3.776194369614835 | 2.127 | 1.959 | 1.837 |
| 3.779335962268425 | 2.129 | 1.959 | 1.837 |
| 3.782477554922014 | 2.131 | 1.96 | 1.837 |
| 3.785619147575604 | 2.133 | 1.96 | 1.838 |
| 3.788760740229193 | 2.135 | 1.96 | 1.838 |
| 3.791902332882783 | 2.137 | 1.96 | 1.839 |
| 3.795043925536373 | 2.139 | 1.96 | 1.839 |
| 3.798185518189962 | 2.141 | 1.961 | 1.839 |
| 3.801327110843552 | 2.143 | 1.961 | 1.84 |
| 3.804468703497142 | 2.145 | 1.961 | 1.84 |
| 3.807610296150731 | 2.147 | 1.961 | 1.841 |
| 3.810751888804321 | 2.149 | 1.961 | 1.842 |
| 3.813893481457911 | 2.151 | 1.962 | 1.842 |
| 3.8170350741115 | 2.152 | 1.962 | 1.843 |
| 3.82017666676509 | 2.154 | 1.962 | 1.843 |
| 3.823318259418679 | 2.156 | 1.962 | 1.844 |
| 3.826459852072269 | 2.158 | 1.962 | 1.845 |
| 3.829601444725859 | 2.16 | 1.962 | 1.845 |
| 3.832743037379448 | 2.162 | 1.962 | 1.846 |
| 3.835884630033038 | 2.164 | 1.962 | 1.847 |
| 3.839026222686627 | 2.166 | 1.963 | 1.848 |
| 3.842167815340217 | 2.167 | 1.963 | 1.848 |
| 3.845309407993807 | 2.169 | 1.963 | 1.849 |
| 3.848451000647396 | 2.171 | 1.963 | 1.85 |
| 3.851592593300986 | 2.173 | 1.963 | 1.851 |
| 3.854734185954575 | 2.175 | 1.963 | 1.852 |
| 3.857875778608165 | 2.177 | 1.963 | 1.853 |
| 3.861017371261755 | 2.178 | 1.963 | 1.854 |
| 3.864158963915344 | 2.18 | 1.963 | 1.855 |
| 3.867300556568933 | 2.182 | 1.963 | 1.856 |
| 3.870442149222523 | 2.184 | 1.963 | 1.857 |
| 3.873583741876112 | 2.185 | 1.963 | 1.858 |
| 3.876725334529703 | 2.187 | 1.963 | 1.859 |
| 3.879866927183292 | 2.189 | 1.963 | 1.86 |
| 3.883008519836882 | 2.191 | 1.963 | 1.861 |
| 3.886150112490471 | 2.192 | 1.963 | 1.862 |
| 3.889291705144061 | 2.194 | 1.963 | 1.863 |
| 3.892433297797651 | 2.196 | 1.963 | 1.865 |
| 3.89557489045124 | 2.197 | 1.963 | 1.866 |
| 3.89871648310483 | 2.199 | 1.963 | 1.867 |
| 3.901858075758419 | 2.201 | 1.963 | 1.869 |
| 3.904999668412009 | 2.202 | 1.963 | 1.87 |
| 3.908141261065598 | 2.204 | 1.963 | 1.871 |
| 3.911282853719188 | 2.206 | 1.963 | 1.873 |
| 3.914424446372778 | 2.207 | 1.963 | 1.874 |
| 3.917566039026367 | 2.209 | 1.963 | 1.876 |
| 3.920707631679957 | 2.21 | 1.963 | 1.877 |
| 3.923849224333547 | 2.212 | 1.963 | 1.879 |
| 3.926990816987136 | 2.213 | 1.963 | 1.88 |
| 3.930132409640726 | 2.215 | 1.963 | 1.882 |
| 3.933274002294315 | 2.217 | 1.963 | 1.883 |
| 3.936415594947905 | 2.218 | 1.963 | 1.885 |
| 3.939557187601495 | 2.22 | 1.963 | 1.887 |
| 3.942698780255084 | 2.221 | 1.964 | 1.888 |
| 3.945840372908674 | 2.223 | 1.964 | 1.89 |
| 3.948981965562263 | 2.224 | 1.964 | 1.892 |
| 3.952123558215853 | 2.226 | 1.964 | 1.894 |
| 3.955265150869442 | 2.227 | 1.964 | 1.895 |
| 3.958406743523032 | 2.229 | 1.964 | 1.897 |
| 3.961548336176622 | 2.23 | 1.964 | 1.899 |
| 3.964689928830211 | 2.232 | 1.964 | 1.901 |
| 3.967831521483801 | 2.233 | 1.964 | 1.903 |
| 3.97097311413739 | 2.235 | 1.964 | 1.905 |
| 3.97411470679098 | 2.236 | 1.964 | 1.907 |
| 3.97725629944457 | 2.237 | 1.964 | 1.909 |
| 3.98039789209816 | 2.239 | 1.964 | 1.911 |
| 3.983539484751749 | 2.24 | 1.964 | 1.913 |
| 3.986681077405338 | 2.242 | 1.964 | 1.915 |
| 3.989822670058928 | 2.243 | 1.964 | 1.917 |
| 3.992964262712517 | 2.244 | 1.964 | 1.92 |
| 3.996105855366107 | 2.246 | 1.964 | 1.922 |
| 3.999247448019697 | 2.247 | 1.964 | 1.924 |
| 4.002389040673287 | 2.248 | 1.964 | 1.926 |
| 4.005530633326877 | 2.25 | 1.964 | 1.929 |
| 4.008672225980466 | 2.251 | 1.964 | 1.931 |
| 4.011813818634056 | 2.252 | 1.964 | 1.933 |
| 4.014955411287645 | 2.254 | 1.964 | 1.935 |
| 4.018097003941234 | 2.255 | 1.964 | 1.938 |
| 4.021238596594824 | 2.256 | 1.965 | 1.94 |
| 4.024380189248414 | 2.257 | 1.965 | 1.943 |
| 4.027521781902004 | 2.259 | 1.965 | 1.945 |
| 4.030663374555593 | 2.26 | 1.965 | 1.948 |
| 4.033804967209183 | 2.261 | 1.965 | 1.95 |
| 4.036946559862773 | 2.262 | 1.965 | 1.953 |
| 4.040088152516362 | 2.264 | 1.965 | 1.955 |
| 4.043229745169951 | 2.265 | 1.966 | 1.958 |
| 4.046371337823541 | 2.266 | 1.966 | 1.96 |
| 4.049512930477131 | 2.267 | 1.966 | 1.963 |
| 4.05265452313072 | 2.268 | 1.966 | 1.966 |
| 4.05579611578431 | 2.27 | 1.966 | 1.968 |
| 4.0589377084379 | 2.271 | 1.967 | 1.971 |
| 4.062079301091489 | 2.272 | 1.967 | 1.974 |
| 4.065220893745079 | 2.273 | 1.967 | 1.976 |
| 4.068362486398668 | 2.274 | 1.967 | 1.979 |
| 4.071504079052258 | 2.275 | 1.967 | 1.982 |
| 4.074645671705848 | 2.277 | 1.968 | 1.985 |
| 4.077787264359437 | 2.278 | 1.968 | 1.987 |
| 4.080928857013027 | 2.279 | 1.968 | 1.99 |
| 4.084070449666616 | 2.28 | 1.969 | 1.993 |
| 4.087212042320206 | 2.281 | 1.969 | 1.996 |
| 4.090353634973795 | 2.282 | 1.969 | 1.999 |
| 4.093495227627385 | 2.283 | 1.97 | 2.002 |
| 4.096636820280975 | 2.284 | 1.97 | 2.005 |
| 4.099778412934564 | 2.285 | 1.97 | 2.007 |
| 4.102920005588154 | 2.286 | 1.971 | 2.01 |
| 4.106061598241744 | 2.287 | 1.971 | 2.013 |
| 4.109203190895333 | 2.288 | 1.971 | 2.016 |
| 4.112344783548923 | 2.289 | 1.972 | 2.019 |
| 4.115486376202512 | 2.29 | 1.972 | 2.022 |
| 4.118627968856102 | 2.291 | 1.973 | 2.025 |
| 4.121769561509692 | 2.292 | 1.973 | 2.028 |
| 4.124911154163281 | 2.293 | 1.974 | 2.031 |
| 4.128052746816871 | 2.294 | 1.974 | 2.034 |
| 4.13119433947046 | 2.295 | 1.974 | 2.037 |
| 4.13433593212405 | 2.296 | 1.975 | 2.04 |
| 4.13747752477764 | 2.297 | 1.975 | 2.043 |
| 4.14061911743123 | 2.298 | 1.976 | 2.047 |
| 4.143760710084818 | 2.299 | 1.977 | 2.05 |
| 4.146902302738408 | 2.3 | 1.977 | 2.053 |
| 4.150043895391998 | 2.301 | 1.978 | 2.056 |
| 4.153185488045588 | 2.301 | 1.978 | 2.059 |
| 4.156327080699177 | 2.302 | 1.979 | 2.062 |
| 4.159468673352766 | 2.303 | 1.98 | 2.065 |
| 4.162610266006356 | 2.304 | 1.98 | 2.068 |
| 4.165751858659946 | 2.305 | 1.981 | 2.071 |
| 4.168893451313535 | 2.306 | 1.982 | 2.075 |
| 4.172035043967125 | 2.307 | 1.982 | 2.078 |
| 4.175176636620715 | 2.307 | 1.983 | 2.081 |
| 4.178318229274304 | 2.308 | 1.984 | 2.084 |
| 4.181459821927894 | 2.309 | 1.984 | 2.087 |
| 4.184601414581484 | 2.31 | 1.985 | 2.09 |
| 4.187743007235073 | 2.311 | 1.986 | 2.093 |
| 4.190884599888663 | 2.311 | 1.987 | 2.096 |
| 4.194026192542252 | 2.312 | 1.987 | 2.1 |
| 4.197167785195842 | 2.313 | 1.988 | 2.103 |
| 4.200309377849432 | 2.314 | 1.989 | 2.106 |
| 4.203450970503021 | 2.314 | 1.99 | 2.109 |
| 4.206592563156611 | 2.315 | 1.991 | 2.112 |
| 4.2097341558102 | 2.316 | 1.992 | 2.115 |
| 4.21287574846379 | 2.317 | 1.993 | 2.118 |
| 4.21601734111738 | 2.317 | 1.994 | 2.122 |
| 4.21915893377097 | 2.318 | 1.995 | 2.125 |
| 4.222300526424559 | 2.319 | 1.996 | 2.128 |
| 4.225442119078148 | 2.319 | 1.996 | 2.131 |
| 4.228583711731738 | 2.32 | 1.998 | 2.134 |
| 4.231725304385327 | 2.321 | 1.999 | 2.137 |
| 4.234866897038917 | 2.322 | 2 | 2.14 |
| 4.238008489692506 | 2.322 | 2.001 | 2.143 |
| 4.241150082346096 | 2.323 | 2.002 | 2.146 |
| 4.244291674999685 | 2.323 | 2.003 | 2.149 |
| 4.247433267653276 | 2.324 | 2.004 | 2.152 |
| 4.250574860306865 | 2.325 | 2.005 | 2.155 |
| 4.253716452960455 | 2.325 | 2.006 | 2.159 |
| 4.256858045614044 | 2.326 | 2.007 | 2.162 |
| 4.259999638267634 | 2.327 | 2.009 | 2.165 |
| 4.263141230921224 | 2.327 | 2.01 | 2.168 |
| 4.266282823574813 | 2.328 | 2.011 | 2.171 |
| 4.269424416228403 | 2.328 | 2.012 | 2.173 |
| 4.272566008881992 | 2.329 | 2.013 | 2.176 |
| 4.275707601535582 | 2.329 | 2.015 | 2.179 |
| 4.27884919418917 | 2.33 | 2.016 | 2.182 |
| 4.28199078684276 | 2.331 | 2.017 | 2.185 |
| 4.285132379496351 | 2.331 | 2.019 | 2.188 |
| 4.28827397214994 | 2.332 | 2.02 | 2.191 |
| 4.29141556480353 | 2.332 | 2.022 | 2.194 |
| 4.294557157457119 | 2.333 | 2.023 | 2.197 |
| 4.29769875011071 | 2.333 | 2.024 | 2.2 |
| 4.300840342764299 | 2.334 | 2.026 | 2.202 |
| 4.303981935417888 | 2.334 | 2.027 | 2.205 |
| 4.307123528071478 | 2.335 | 2.029 | 2.208 |
| 4.310265120725067 | 2.335 | 2.03 | 2.211 |
| 4.313406713378657 | 2.336 | 2.032 | 2.213 |
| 4.316548306032247 | 2.336 | 2.033 | 2.216 |
| 4.319689898685836 | 2.337 | 2.035 | 2.219 |
| 4.322831491339426 | 2.337 | 2.036 | 2.221 |
| 4.325973083993015 | 2.338 | 2.038 | 2.224 |
| 4.329114676646605 | 2.338 | 2.04 | 2.227 |
| 4.332256269300195 | 2.338 | 2.041 | 2.229 |
| 4.335397861953784 | 2.339 | 2.043 | 2.232 |
| 4.338539454607374 | 2.339 | 2.045 | 2.234 |
| 4.341681047260963 | 2.34 | 2.046 | 2.237 |
| 4.344822639914553 | 2.34 | 2.048 | 2.24 |
| 4.347964232568143 | 2.34 | 2.05 | 2.242 |
| 4.351105825221732 | 2.341 | 2.052 | 2.244 |
| 4.354247417875322 | 2.341 | 2.053 | 2.247 |
| 4.357389010528911 | 2.342 | 2.055 | 2.249 |
| 4.360530603182501 | 2.342 | 2.057 | 2.252 |
| 4.36367219583609 | 2.342 | 2.059 | 2.254 |
| 4.36681378848968 | 2.343 | 2.061 | 2.256 |
| 4.36995538114327 | 2.343 | 2.062 | 2.259 |
| 4.373096973796859 | 2.343 | 2.064 | 2.261 |
| 4.376238566450449 | 2.344 | 2.066 | 2.263 |
| 4.379380159104038 | 2.344 | 2.068 | 2.266 |
| 4.382521751757628 | 2.344 | 2.07 | 2.268 |
| 4.385663344411217 | 2.345 | 2.072 | 2.27 |
| 4.388804937064807 | 2.345 | 2.074 | 2.272 |
| 4.391946529718397 | 2.345 | 2.076 | 2.274 |
| 4.395088122371987 | 2.346 | 2.078 | 2.276 |
| 4.398229715025576 | 2.346 | 2.08 | 2.278 |
| 4.401371307679165 | 2.346 | 2.082 | 2.28 |
| 4.404512900332755 | 2.347 | 2.084 | 2.282 |
| 4.407654492986345 | 2.347 | 2.086 | 2.284 |
| 4.410796085639934 | 2.347 | 2.089 | 2.286 |
| 4.413937678293524 | 2.347 | 2.091 | 2.288 |
| 4.417079270947114 | 2.348 | 2.093 | 2.29 |
| 4.420220863600703 | 2.348 | 2.095 | 2.292 |
| 4.423362456254293 | 2.348 | 2.097 | 2.294 |
| 4.426504048907883 | 2.349 | 2.099 | 2.296 |
| 4.429645641561472 | 2.349 | 2.102 | 2.297 |
| 4.432787234215062 | 2.349 | 2.104 | 2.299 |
| 4.435928826868651 | 2.349 | 2.106 | 2.301 |
| 4.43907041952224 | 2.349 | 2.109 | 2.303 |
| 4.44221201217583 | 2.35 | 2.111 | 2.304 |
| 4.44535360482942 | 2.35 | 2.113 | 2.306 |
| 4.44849519748301 | 2.35 | 2.115 | 2.308 |
| 4.4516367901366 | 2.35 | 2.118 | 2.309 |
| 4.454778382790188 | 2.351 | 2.12 | 2.311 |
| 4.457919975443779 | 2.351 | 2.123 | 2.312 |
| 4.461061568097368 | 2.351 | 2.125 | 2.314 |
| 4.464203160750958 | 2.351 | 2.127 | 2.315 |
| 4.467344753404547 | 2.351 | 2.13 | 2.317 |
| 4.470486346058137 | 2.352 | 2.132 | 2.318 |
| 4.473627938711726 | 2.352 | 2.135 | 2.319 |
| 4.476769531365316 | 2.352 | 2.137 | 2.321 |
| 4.479911124018905 | 2.352 | 2.14 | 2.322 |
| 4.483052716672495 | 2.352 | 2.142 | 2.323 |
| 4.486194309326085 | 2.352 | 2.145 | 2.325 |
| 4.489335901979674 | 2.353 | 2.147 | 2.326 |
| 4.492477494633264 | 2.353 | 2.15 | 2.327 |
| 4.495619087286854 | 2.353 | 2.153 | 2.328 |
| 4.498760679940443 | 2.353 | 2.155 | 2.329 |
| 4.501902272594033 | 2.353 | 2.158 | 2.33 |
| 4.505043865247622 | 2.353 | 2.16 | 2.331 |
| 4.508185457901212 | 2.353 | 2.163 | 2.332 |
| 4.511327050554801 | 2.354 | 2.166 | 2.334 |
| 4.514468643208391 | 2.354 | 2.168 | 2.335 |
| 4.517610235861981 | 2.354 | 2.171 | 2.335 |
| 4.520751828515571 | 2.354 | 2.174 | 2.336 |
| 4.52389342116916 | 2.354 | 2.176 | 2.337 |
| 4.52703501382275 | 2.354 | 2.179 | 2.338 |
| 4.530176606476339 | 2.354 | 2.182 | 2.339 |
| 4.533318199129928 | 2.354 | 2.185 | 2.34 |
| 4.536459791783518 | 2.354 | 2.187 | 2.341 |
| 4.539601384437108 | 2.354 | 2.19 | 2.342 |
| 4.542742977090698 | 2.355 | 2.193 | 2.342 |
| 4.545884569744287 | 2.355 | 2.196 | 2.343 |
| 4.549026162397876 | 2.355 | 2.199 | 2.344 |
| 4.552167755051466 | 2.355 | 2.201 | 2.344 |
| 4.555309347705056 | 2.355 | 2.204 | 2.345 |
| 4.558450940358646 | 2.355 | 2.207 | 2.346 |
| 4.561592533012235 | 2.355 | 2.21 | 2.346 |
| 4.564734125665825 | 2.355 | 2.213 | 2.347 |
| 4.567875718319415 | 2.355 | 2.216 | 2.347 |
| 4.571017310973004 | 2.355 | 2.219 | 2.348 |
| 4.574158903626594 | 2.355 | 2.221 | 2.349 |
| 4.577300496280183 | 2.355 | 2.224 | 2.349 |
| 4.580442088933772 | 2.355 | 2.227 | 2.35 |
| 4.583583681587362 | 2.355 | 2.23 | 2.35 |
| 4.586725274240952 | 2.356 | 2.233 | 2.35 |
| 4.589866866894542 | 2.356 | 2.236 | 2.351 |
| 4.593008459548131 | 2.356 | 2.239 | 2.351 |
| 4.596150052201721 | 2.356 | 2.242 | 2.352 |
| 4.59929164485531 | 2.356 | 2.245 | 2.352 |
| 4.6024332375089 | 2.356 | 2.248 | 2.352 |
| 4.60557483016249 | 2.356 | 2.251 | 2.353 |
| 4.608716422816079 | 2.356 | 2.254 | 2.353 |
| 4.611858015469668 | 2.356 | 2.257 | 2.353 |
| 4.614999608123258 | 2.356 | 2.26 | 2.353 |
| 4.618141200776848 | 2.356 | 2.263 | 2.354 |
| 4.621282793430437 | 2.356 | 2.266 | 2.354 |
| 4.624424386084027 | 2.356 | 2.269 | 2.354 |
| 4.627565978737617 | 2.356 | 2.272 | 2.354 |
| 4.630707571391206 | 2.356 | 2.275 | 2.355 |
| 4.633849164044795 | 2.356 | 2.278 | 2.355 |
| 4.636990756698386 | 2.356 | 2.281 | 2.355 |
| 4.640132349351975 | 2.356 | 2.284 | 2.355 |
| 4.643273942005564 | 2.356 | 2.288 | 2.355 |
| 4.646415534659154 | 2.356 | 2.291 | 2.355 |
| 4.649557127312744 | 2.356 | 2.294 | 2.355 |
| 4.652698719966334 | 2.356 | 2.297 | 2.356 |
| 4.655840312619923 | 2.356 | 2.3 | 2.356 |
| 4.658981905273513 | 2.356 | 2.303 | 2.356 |
| 4.662123497927102 | 2.356 | 2.306 | 2.356 |
| 4.665265090580692 | 2.356 | 2.309 | 2.356 |
| 4.668406683234282 | 2.356 | 2.312 | 2.356 |
| 4.671548275887871 | 2.356 | 2.315 | 2.356 |
| 4.674689868541461 | 2.356 | 2.319 | 2.356 |
| 4.67783146119505 | 2.356 | 2.322 | 2.356 |
| 4.68097305384864 | 2.356 | 2.325 | 2.356 |
| 4.68411464650223 | 2.356 | 2.328 | 2.356 |
| 4.687256239155819 | 2.356 | 2.331 | 2.356 |
| 4.690397831809409 | 2.356 | 2.334 | 2.356 |
| 4.693539424462998 | 2.356 | 2.337 | 2.356 |
| 4.696681017116588 | 2.356 | 2.34 | 2.356 |
| 4.699822609770177 | 2.356 | 2.344 | 2.356 |
| 4.702964202423767 | 2.356 | 2.347 | 2.356 |
| 4.706105795077356 | 2.356 | 2.35 | 2.356 |
| 4.709247387730946 | 2.356 | 2.353 | 2.356 |
| 4.712388980384535 | 2.356 | 2.356 | 2.356 |
| 4.715530573038126 | 2.356 | 2.359 | 2.356 |
| 4.718672165691715 | 2.356 | 2.362 | 2.356 |
| 4.721813758345305 | 2.356 | 2.366 | 2.356 |
| 4.724955350998894 | 2.356 | 2.369 | 2.356 |
| 4.728096943652484 | 2.356 | 2.372 | 2.356 |
| 4.731238536306074 | 2.356 | 2.375 | 2.356 |
| 4.734380128959663 | 2.356 | 2.378 | 2.356 |
| 4.737521721613253 | 2.356 | 2.381 | 2.356 |
| 4.740663314266842 | 2.356 | 2.384 | 2.356 |
| 4.743804906920432 | 2.356 | 2.388 | 2.356 |
| 4.74694649957402 | 2.356 | 2.391 | 2.356 |
| 4.750088092227611 | 2.356 | 2.394 | 2.356 |
| 4.7532296848812 | 2.356 | 2.397 | 2.356 |
| 4.75637127753479 | 2.356 | 2.4 | 2.356 |
| 4.75951287018838 | 2.356 | 2.403 | 2.357 |
| 4.76265446284197 | 2.356 | 2.406 | 2.357 |
| 4.765796055495559 | 2.356 | 2.409 | 2.357 |
| 4.768937648149149 | 2.356 | 2.413 | 2.357 |
| 4.772079240802738 | 2.356 | 2.416 | 2.357 |
| 4.775220833456327 | 2.356 | 2.419 | 2.357 |
| 4.778362426109917 | 2.356 | 2.422 | 2.357 |
| 4.781504018763507 | 2.356 | 2.425 | 2.357 |
| 4.784645611417097 | 2.356 | 2.428 | 2.357 |
| 4.787787204070686 | 2.356 | 2.431 | 2.357 |
| 4.790928796724275 | 2.356 | 2.434 | 2.358 |
| 4.794070389377865 | 2.356 | 2.437 | 2.358 |
| 4.797211982031455 | 2.356 | 2.44 | 2.358 |
| 4.800353574685045 | 2.356 | 2.443 | 2.358 |
| 4.803495167338634 | 2.356 | 2.446 | 2.358 |
| 4.806636759992224 | 2.356 | 2.449 | 2.359 |
| 4.809778352645814 | 2.357 | 2.452 | 2.359 |
| 4.812919945299403 | 2.357 | 2.455 | 2.359 |
| 4.816061537952993 | 2.357 | 2.458 | 2.359 |
| 4.819203130606582 | 2.357 | 2.461 | 2.36 |
| 4.822344723260172 | 2.357 | 2.464 | 2.36 |
| 4.825486315913761 | 2.357 | 2.467 | 2.36 |
| 4.828627908567351 | 2.357 | 2.47 | 2.361 |
| 4.83176950122094 | 2.357 | 2.473 | 2.361 |
| 4.83491109387453 | 2.357 | 2.476 | 2.362 |
| 4.83805268652812 | 2.357 | 2.479 | 2.362 |
| 4.841194279181709 | 2.357 | 2.482 | 2.362 |
| 4.844335871835299 | 2.357 | 2.485 | 2.363 |
| 4.847477464488889 | 2.357 | 2.488 | 2.363 |
| 4.850619057142478 | 2.357 | 2.491 | 2.364 |
| 4.853760649796068 | 2.357 | 2.494 | 2.364 |
| 4.856902242449657 | 2.357 | 2.497 | 2.365 |
| 4.860043835103247 | 2.357 | 2.5 | 2.365 |
| 4.863185427756837 | 2.357 | 2.503 | 2.366 |
| 4.866327020410426 | 2.357 | 2.505 | 2.367 |
| 4.869468613064015 | 2.357 | 2.508 | 2.367 |
| 4.872610205717605 | 2.358 | 2.511 | 2.368 |
| 4.875751798371195 | 2.358 | 2.514 | 2.369 |
| 4.878893391024784 | 2.358 | 2.517 | 2.369 |
| 4.882034983678374 | 2.358 | 2.519 | 2.37 |
| 4.885176576331964 | 2.358 | 2.522 | 2.371 |
| 4.888318168985553 | 2.358 | 2.525 | 2.372 |
| 4.891459761639143 | 2.358 | 2.528 | 2.372 |
| 4.894601354292733 | 2.358 | 2.531 | 2.373 |
| 4.897742946946322 | 2.358 | 2.533 | 2.374 |
| 4.900884539599912 | 2.358 | 2.536 | 2.375 |
| 4.904026132253501 | 2.359 | 2.539 | 2.376 |
| 4.907167724907091 | 2.359 | 2.541 | 2.377 |
| 4.91030931756068 | 2.359 | 2.544 | 2.378 |
| 4.91345091021427 | 2.359 | 2.547 | 2.379 |
| 4.91659250286786 | 2.359 | 2.549 | 2.38 |
| 4.91973409552145 | 2.359 | 2.552 | 2.381 |
| 4.922875688175039 | 2.359 | 2.555 | 2.382 |
| 4.926017280828628 | 2.359 | 2.557 | 2.383 |
| 4.929158873482218 | 2.36 | 2.56 | 2.384 |
| 4.932300466135808 | 2.36 | 2.562 | 2.385 |
| 4.935442058789397 | 2.36 | 2.565 | 2.387 |
| 4.938583651442987 | 2.36 | 2.568 | 2.388 |
| 4.941725244096576 | 2.36 | 2.57 | 2.389 |
| 4.944866836750166 | 2.36 | 2.573 | 2.39 |
| 4.948008429403755 | 2.361 | 2.575 | 2.392 |
| 4.951150022057345 | 2.361 | 2.578 | 2.393 |
| 4.954291614710935 | 2.361 | 2.58 | 2.394 |
| 4.957433207364524 | 2.361 | 2.583 | 2.396 |
| 4.960574800018114 | 2.361 | 2.585 | 2.397 |
| 4.963716392671704 | 2.361 | 2.587 | 2.399 |
| 4.966857985325293 | 2.362 | 2.59 | 2.4 |
| 4.969999577978883 | 2.362 | 2.592 | 2.402 |
| 4.973141170632472 | 2.362 | 2.595 | 2.403 |
| 4.976282763286062 | 2.362 | 2.597 | 2.405 |
| 4.979424355939651 | 2.362 | 2.599 | 2.406 |
| 4.982565948593241 | 2.363 | 2.602 | 2.408 |
| 4.985707541246831 | 2.363 | 2.604 | 2.41 |
| 4.98884913390042 | 2.363 | 2.606 | 2.411 |
| 4.99199072655401 | 2.363 | 2.608 | 2.413 |
| 4.9951323192076 | 2.364 | 2.611 | 2.415 |
| 4.99827391186119 | 2.364 | 2.613 | 2.417 |
| 5.00141550451478 | 2.364 | 2.615 | 2.418 |
| 5.004557097168369 | 2.364 | 2.617 | 2.42 |
| 5.007698689821958 | 2.365 | 2.619 | 2.422 |
| 5.010840282475548 | 2.365 | 2.622 | 2.424 |
| 5.013981875129137 | 2.365 | 2.624 | 2.426 |
| 5.017123467782727 | 2.365 | 2.626 | 2.428 |
| 5.020265060436317 | 2.366 | 2.628 | 2.43 |
| 5.023406653089906 | 2.366 | 2.63 | 2.432 |
| 5.026548245743496 | 2.366 | 2.632 | 2.434 |
| 5.029689838397085 | 2.367 | 2.634 | 2.436 |
| 5.032831431050674 | 2.367 | 2.636 | 2.438 |
| 5.035973023704264 | 2.367 | 2.638 | 2.44 |
| 5.039114616357854 | 2.368 | 2.64 | 2.442 |
| 5.042256209011444 | 2.368 | 2.642 | 2.445 |
| 5.045397801665033 | 2.368 | 2.644 | 2.447 |
| 5.048539394318622 | 2.369 | 2.646 | 2.449 |
| 5.051680986972213 | 2.369 | 2.648 | 2.451 |
| 5.054822579625802 | 2.369 | 2.65 | 2.454 |
| 5.057964172279392 | 2.37 | 2.652 | 2.456 |
| 5.061105764932981 | 2.37 | 2.654 | 2.458 |
| 5.064247357586571 | 2.37 | 2.655 | 2.461 |
| 5.067388950240161 | 2.371 | 2.657 | 2.463 |
| 5.07053054289375 | 2.371 | 2.659 | 2.465 |
| 5.07367213554734 | 2.372 | 2.661 | 2.468 |
| 5.07681372820093 | 2.372 | 2.663 | 2.47 |
| 5.079955320854519 | 2.372 | 2.664 | 2.473 |
| 5.083096913508108 | 2.373 | 2.666 | 2.475 |
| 5.086238506161698 | 2.373 | 2.668 | 2.478 |
| 5.089380098815288 | 2.374 | 2.669 | 2.48 |
| 5.092521691468877 | 2.374 | 2.671 | 2.483 |
| 5.095663284122466 | 2.374 | 2.673 | 2.486 |
| 5.098804876776057 | 2.375 | 2.674 | 2.488 |
| 5.101946469429646 | 2.375 | 2.676 | 2.491 |
| 5.105088062083236 | 2.376 | 2.678 | 2.494 |
| 5.108229654736825 | 2.376 | 2.679 | 2.496 |
| 5.111371247390415 | 2.377 | 2.681 | 2.499 |
| 5.114512840044005 | 2.377 | 2.682 | 2.502 |
| 5.117654432697594 | 2.378 | 2.684 | 2.505 |
| 5.120796025351184 | 2.378 | 2.685 | 2.507 |
| 5.123937618004773 | 2.379 | 2.687 | 2.51 |
| 5.127079210658363 | 2.379 | 2.688 | 2.513 |
| 5.130220803311953 | 2.38 | 2.689 | 2.516 |
| 5.133362395965542 | 2.38 | 2.691 | 2.519 |
| 5.136503988619131 | 2.381 | 2.692 | 2.521 |
| 5.13964558127272 | 2.381 | 2.694 | 2.524 |
| 5.142787173926311 | 2.382 | 2.695 | 2.527 |
| 5.1459287665799 | 2.382 | 2.696 | 2.53 |
| 5.14907035923349 | 2.383 | 2.698 | 2.533 |
| 5.15221195188708 | 2.383 | 2.699 | 2.536 |
| 5.15535354454067 | 2.384 | 2.7 | 2.539 |
| 5.158495137194259 | 2.385 | 2.701 | 2.542 |
| 5.161636729847848 | 2.385 | 2.703 | 2.545 |
| 5.164778322501438 | 2.386 | 2.704 | 2.548 |
| 5.167919915155028 | 2.386 | 2.705 | 2.551 |
| 5.171061507808617 | 2.387 | 2.706 | 2.554 |
| 5.174203100462206 | 2.388 | 2.707 | 2.557 |
| 5.177344693115796 | 2.388 | 2.708 | 2.56 |
| 5.180486285769386 | 2.389 | 2.71 | 2.563 |
| 5.183627878422976 | 2.39 | 2.711 | 2.566 |
| 5.186769471076565 | 2.39 | 2.712 | 2.569 |
| 5.189911063730155 | 2.391 | 2.713 | 2.572 |
| 5.193052656383744 | 2.392 | 2.714 | 2.575 |
| 5.196194249037334 | 2.392 | 2.715 | 2.578 |
| 5.199335841690924 | 2.393 | 2.716 | 2.581 |
| 5.202477434344513 | 2.394 | 2.717 | 2.585 |
| 5.205619026998103 | 2.394 | 2.718 | 2.588 |
| 5.208760619651692 | 2.395 | 2.719 | 2.591 |
| 5.211902212305282 | 2.396 | 2.72 | 2.594 |
| 5.215043804958871 | 2.396 | 2.721 | 2.597 |
| 5.218185397612461 | 2.397 | 2.722 | 2.6 |
| 5.221326990266051 | 2.398 | 2.722 | 2.603 |
| 5.22446858291964 | 2.399 | 2.723 | 2.606 |
| 5.22761017557323 | 2.399 | 2.724 | 2.61 |
| 5.23075176822682 | 2.4 | 2.725 | 2.613 |
| 5.23389336088041 | 2.401 | 2.726 | 2.616 |
| 5.237034953533999 | 2.402 | 2.727 | 2.619 |
| 5.240176546187588 | 2.403 | 2.727 | 2.622 |
| 5.243318138841178 | 2.403 | 2.728 | 2.625 |
| 5.246459731494767 | 2.404 | 2.729 | 2.628 |
| 5.249601324148357 | 2.405 | 2.729 | 2.632 |
| 5.252742916801947 | 2.406 | 2.73 | 2.635 |
| 5.255884509455536 | 2.407 | 2.731 | 2.638 |
| 5.259026102109125 | 2.407 | 2.732 | 2.641 |
| 5.262167694762715 | 2.408 | 2.732 | 2.644 |
| 5.265309287416305 | 2.409 | 2.733 | 2.647 |
| 5.268450880069895 | 2.41 | 2.733 | 2.65 |
| 5.271592472723484 | 2.411 | 2.734 | 2.653 |
| 5.274734065377074 | 2.412 | 2.735 | 2.657 |
| 5.277875658030664 | 2.413 | 2.735 | 2.66 |
| 5.281017250684253 | 2.414 | 2.736 | 2.663 |
| 5.284158843337843 | 2.415 | 2.736 | 2.666 |
| 5.287300435991432 | 2.415 | 2.737 | 2.669 |
| 5.290442028645022 | 2.416 | 2.737 | 2.672 |
| 5.293583621298612 | 2.417 | 2.738 | 2.675 |
| 5.296725213952201 | 2.418 | 2.738 | 2.678 |
| 5.299866806605791 | 2.419 | 2.739 | 2.681 |
| 5.30300839925938 | 2.42 | 2.739 | 2.684 |
| 5.30614999191297 | 2.421 | 2.74 | 2.687 |
| 5.30929158456656 | 2.422 | 2.74 | 2.69 |
| 5.312433177220149 | 2.423 | 2.741 | 2.693 |
| 5.315574769873739 | 2.424 | 2.741 | 2.696 |
| 5.318716362527328 | 2.425 | 2.741 | 2.699 |
| 5.321857955180918 | 2.426 | 2.742 | 2.702 |
| 5.324999547834508 | 2.427 | 2.742 | 2.705 |
| 5.328141140488097 | 2.428 | 2.743 | 2.708 |
| 5.331282733141686 | 2.429 | 2.743 | 2.711 |
| 5.334424325795276 | 2.43 | 2.743 | 2.714 |
| 5.337565918448866 | 2.432 | 2.744 | 2.716 |
| 5.340707511102456 | 2.433 | 2.744 | 2.719 |
| 5.343849103756045 | 2.434 | 2.744 | 2.722 |
| 5.346990696409634 | 2.435 | 2.744 | 2.725 |
| 5.350132289063224 | 2.436 | 2.745 | 2.728 |
| 5.353273881716814 | 2.437 | 2.745 | 2.731 |
| 5.356415474370403 | 2.438 | 2.745 | 2.733 |
| 5.359557067023993 | 2.439 | 2.745 | 2.736 |
| 5.362698659677583 | 2.44 | 2.746 | 2.739 |
| 5.365840252331172 | 2.442 | 2.746 | 2.741 |
| 5.368981844984762 | 2.443 | 2.746 | 2.744 |
| 5.372123437638351 | 2.444 | 2.746 | 2.747 |
| 5.375265030291941 | 2.445 | 2.746 | 2.749 |
| 5.378406622945531 | 2.446 | 2.747 | 2.752 |
| 5.38154821559912 | 2.447 | 2.747 | 2.755 |
| 5.38468980825271 | 2.449 | 2.747 | 2.757 |
| 5.387831400906299 | 2.45 | 2.747 | 2.76 |
| 5.39097299355989 | 2.451 | 2.747 | 2.762 |
| 5.394114586213479 | 2.452 | 2.747 | 2.765 |
| 5.397256178867068 | 2.454 | 2.748 | 2.767 |
| 5.400397771520657 | 2.455 | 2.748 | 2.77 |
| 5.403539364174247 | 2.456 | 2.748 | 2.772 |
| 5.406680956827837 | 2.457 | 2.748 | 2.775 |
| 5.409822549481426 | 2.459 | 2.748 | 2.777 |
| 5.412964142135016 | 2.46 | 2.748 | 2.779 |
| 5.416105734788605 | 2.461 | 2.748 | 2.782 |
| 5.419247327442195 | 2.463 | 2.748 | 2.784 |
| 5.422388920095785 | 2.464 | 2.748 | 2.786 |
| 5.425530512749375 | 2.465 | 2.748 | 2.788 |
| 5.428672105402964 | 2.467 | 2.748 | 2.791 |
| 5.431813698056554 | 2.468 | 2.749 | 2.793 |
| 5.434955290710143 | 2.469 | 2.749 | 2.795 |
| 5.438096883363733 | 2.471 | 2.749 | 2.797 |
| 5.441238476017322 | 2.472 | 2.749 | 2.799 |
| 5.444380068670912 | 2.474 | 2.749 | 2.801 |
| 5.447521661324502 | 2.475 | 2.749 | 2.803 |
| 5.450663253978091 | 2.476 | 2.749 | 2.805 |
| 5.453804846631681 | 2.478 | 2.749 | 2.807 |
| 5.456946439285271 | 2.479 | 2.749 | 2.809 |
| 5.46008803193886 | 2.481 | 2.749 | 2.811 |
| 5.46322962459245 | 2.482 | 2.749 | 2.813 |
| 5.466371217246039 | 2.484 | 2.749 | 2.815 |
| 5.46951280989963 | 2.485 | 2.749 | 2.817 |
| 5.472654402553218 | 2.487 | 2.749 | 2.819 |
| 5.475795995206808 | 2.488 | 2.749 | 2.821 |
| 5.478937587860398 | 2.49 | 2.749 | 2.822 |
| 5.482079180513987 | 2.491 | 2.749 | 2.824 |
| 5.485220773167577 | 2.493 | 2.749 | 2.826 |
| 5.488362365821166 | 2.494 | 2.749 | 2.827 |
| 5.491503958474756 | 2.496 | 2.749 | 2.829 |
| 5.494645551128346 | 2.497 | 2.749 | 2.831 |
| 5.497787143781935 | 2.499 | 2.749 | 2.832 |
| 5.500928736435525 | 2.5 | 2.749 | 2.834 |
| 5.504070329089115 | 2.502 | 2.749 | 2.835 |
| 5.507211921742704 | 2.504 | 2.749 | 2.837 |
| 5.510353514396294 | 2.505 | 2.749 | 2.838 |
| 5.513495107049883 | 2.507 | 2.749 | 2.84 |
| 5.516636699703473 | 2.508 | 2.749 | 2.841 |
| 5.519778292357062 | 2.51 | 2.749 | 2.842 |
| 5.522919885010652 | 2.512 | 2.749 | 2.844 |
| 5.526061477664242 | 2.513 | 2.749 | 2.845 |
| 5.529203070317831 | 2.515 | 2.749 | 2.846 |
| 5.532344662971421 | 2.517 | 2.749 | 2.848 |
| 5.535486255625011 | 2.518 | 2.749 | 2.849 |
| 5.5386278482786 | 2.52 | 2.749 | 2.85 |
| 5.54176944093219 | 2.522 | 2.749 | 2.851 |
| 5.544911033585779 | 2.524 | 2.749 | 2.852 |
| 5.54805262623937 | 2.525 | 2.749 | 2.854 |
| 5.551194218892959 | 2.527 | 2.749 | 2.855 |
| 5.554335811546548 | 2.529 | 2.749 | 2.856 |
| 5.557477404200137 | 2.531 | 2.749 | 2.857 |
| 5.560618996853727 | 2.532 | 2.749 | 2.858 |
| 5.563760589507317 | 2.534 | 2.749 | 2.859 |
| 5.566902182160906 | 2.536 | 2.749 | 2.86 |
| 5.570043774814496 | 2.538 | 2.749 | 2.861 |
| 5.573185367468086 | 2.539 | 2.749 | 2.862 |
| 5.576326960121675 | 2.541 | 2.75 | 2.862 |
| 5.579468552775264 | 2.543 | 2.75 | 2.863 |
| 5.582610145428854 | 2.545 | 2.75 | 2.864 |
| 5.585751738082444 | 2.547 | 2.75 | 2.865 |
| 5.588893330736034 | 2.549 | 2.75 | 2.866 |
| 5.592034923389623 | 2.55 | 2.75 | 2.866 |
| 5.595176516043213 | 2.552 | 2.75 | 2.867 |
| 5.598318108696803 | 2.554 | 2.75 | 2.868 |
| 5.601459701350392 | 2.556 | 2.75 | 2.868 |
| 5.604601294003982 | 2.558 | 2.751 | 2.869 |
| 5.607742886657571 | 2.56 | 2.751 | 2.87 |
| 5.610884479311161 | 2.562 | 2.751 | 2.87 |
| 5.61402607196475 | 2.564 | 2.751 | 2.871 |
| 5.61716766461834 | 2.566 | 2.751 | 2.871 |
| 5.62030925727193 | 2.568 | 2.751 | 2.872 |
| 5.623450849925519 | 2.57 | 2.752 | 2.872 |
| 5.626592442579109 | 2.572 | 2.752 | 2.873 |
| 5.629734035232698 | 2.574 | 2.752 | 2.873 |
| 5.632875627886288 | 2.576 | 2.752 | 2.874 |
| 5.636017220539878 | 2.578 | 2.752 | 2.874 |
| 5.639158813193467 | 2.58 | 2.753 | 2.875 |
| 5.642300405847057 | 2.582 | 2.753 | 2.875 |
| 5.645441998500646 | 2.584 | 2.753 | 2.875 |
| 5.648583591154236 | 2.586 | 2.753 | 2.876 |
| 5.651725183807825 | 2.588 | 2.754 | 2.876 |
| 5.654866776461415 | 2.59 | 2.754 | 2.876 |
| 5.658008369115005 | 2.592 | 2.754 | 2.877 |
| 5.661149961768594 | 2.594 | 2.755 | 2.877 |
| 5.664291554422184 | 2.596 | 2.755 | 2.877 |
| 5.667433147075774 | 2.598 | 2.755 | 2.877 |
| 5.670574739729363 | 2.6 | 2.756 | 2.878 |
| 5.673716332382953 | 2.602 | 2.756 | 2.878 |
| 5.676857925036542 | 2.604 | 2.756 | 2.878 |
| 5.679999517690132 | 2.606 | 2.757 | 2.878 |
| 5.683141110343721 | 2.609 | 2.757 | 2.878 |
| 5.686282702997311 | 2.611 | 2.758 | 2.879 |
| 5.689424295650901 | 2.613 | 2.758 | 2.879 |
| 5.69256588830449 | 2.615 | 2.758 | 2.879 |
| 5.69570748095808 | 2.617 | 2.759 | 2.879 |
| 5.69884907361167 | 2.619 | 2.759 | 2.879 |
| 5.701990666265259 | 2.622 | 2.76 | 2.879 |
| 5.705132258918849 | 2.624 | 2.76 | 2.879 |
| 5.708273851572438 | 2.626 | 2.761 | 2.879 |
| 5.711415444226028 | 2.628 | 2.761 | 2.879 |
| 5.714557036879618 | 2.63 | 2.762 | 2.88 |
| 5.717698629533207 | 2.633 | 2.763 | 2.88 |
| 5.720840222186797 | 2.635 | 2.763 | 2.88 |
| 5.723981814840386 | 2.637 | 2.764 | 2.88 |
| 5.727123407493976 | 2.639 | 2.764 | 2.88 |
| 5.730265000147565 | 2.642 | 2.765 | 2.88 |
| 5.733406592801155 | 2.644 | 2.766 | 2.88 |
| 5.736548185454744 | 2.646 | 2.766 | 2.88 |
| 5.739689778108334 | 2.649 | 2.767 | 2.88 |
| 5.742831370761924 | 2.651 | 2.768 | 2.88 |
| 5.745972963415514 | 2.653 | 2.768 | 2.88 |
| 5.749114556069103 | 2.655 | 2.769 | 2.88 |
| 5.752256148722693 | 2.658 | 2.77 | 2.88 |
| 5.755397741376282 | 2.66 | 2.771 | 2.88 |
| 5.758539334029872 | 2.663 | 2.771 | 2.88 |
| 5.761680926683462 | 2.665 | 2.772 | 2.88 |
| 5.764822519337051 | 2.667 | 2.773 | 2.88 |
| 5.767964111990641 | 2.67 | 2.774 | 2.88 |
| 5.77110570464423 | 2.672 | 2.775 | 2.88 |
| 5.77424729729782 | 2.674 | 2.775 | 2.88 |
| 5.77738888995141 | 2.677 | 2.776 | 2.88 |
| 5.780530482605 | 2.679 | 2.777 | 2.88 |
| 5.783672075258588 | 2.682 | 2.778 | 2.88 |
| 5.786813667912178 | 2.684 | 2.779 | 2.88 |
| 5.789955260565768 | 2.686 | 2.78 | 2.88 |
| 5.793096853219358 | 2.689 | 2.781 | 2.88 |
| 5.796238445872947 | 2.691 | 2.782 | 2.88 |
| 5.799380038526537 | 2.694 | 2.783 | 2.88 |
| 5.802521631180126 | 2.696 | 2.784 | 2.88 |
| 5.805663223833715 | 2.699 | 2.785 | 2.88 |
| 5.808804816487306 | 2.701 | 2.786 | 2.88 |
| 5.811946409140895 | 2.704 | 2.787 | 2.88 |
| 5.815088001794485 | 2.706 | 2.788 | 2.88 |
| 5.818229594448074 | 2.709 | 2.789 | 2.88 |
| 5.821371187101663 | 2.711 | 2.79 | 2.88 |
| 5.824512779755254 | 2.714 | 2.792 | 2.881 |
| 5.827654372408843 | 2.716 | 2.793 | 2.881 |
| 5.830795965062433 | 2.719 | 2.794 | 2.881 |
| 5.833937557716022 | 2.721 | 2.795 | 2.881 |
| 5.837079150369612 | 2.724 | 2.796 | 2.881 |
| 5.840220743023201 | 2.726 | 2.798 | 2.881 |
| 5.843362335676791 | 2.729 | 2.799 | 2.882 |
| 5.846503928330381 | 2.732 | 2.8 | 2.882 |
| 5.84964552098397 | 2.734 | 2.801 | 2.882 |
| 5.85278711363756 | 2.737 | 2.803 | 2.882 |
| 5.85592870629115 | 2.739 | 2.804 | 2.882 |
| 5.85907029894474 | 2.742 | 2.806 | 2.883 |
| 5.862211891598329 | 2.745 | 2.807 | 2.883 |
| 5.865353484251918 | 2.747 | 2.808 | 2.883 |
| 5.868495076905508 | 2.75 | 2.81 | 2.884 |
| 5.871636669559098 | 2.753 | 2.811 | 2.884 |
| 5.874778262212687 | 2.755 | 2.813 | 2.884 |
| 5.877919854866277 | 2.758 | 2.814 | 2.885 |
| 5.881061447519866 | 2.76 | 2.816 | 2.885 |
| 5.884203040173456 | 2.763 | 2.817 | 2.885 |
| 5.887344632827046 | 2.766 | 2.819 | 2.886 |
| 5.890486225480635 | 2.768 | 2.82 | 2.886 |
| 5.893627818134224 | 2.771 | 2.822 | 2.887 |
| 5.896769410787814 | 2.774 | 2.823 | 2.887 |
| 5.899911003441404 | 2.777 | 2.825 | 2.888 |
| 5.903052596094994 | 2.779 | 2.827 | 2.888 |
| 5.906194188748583 | 2.782 | 2.828 | 2.889 |
| 5.909335781402172 | 2.785 | 2.83 | 2.889 |
| 5.912477374055762 | 2.787 | 2.832 | 2.89 |
| 5.915618966709352 | 2.79 | 2.833 | 2.891 |
| 5.918760559362942 | 2.793 | 2.835 | 2.891 |
| 5.921902152016531 | 2.796 | 2.837 | 2.892 |
| 5.92504374467012 | 2.798 | 2.839 | 2.893 |
| 5.92818533732371 | 2.801 | 2.841 | 2.893 |
| 5.9313269299773 | 2.804 | 2.842 | 2.894 |
| 5.93446852263089 | 2.807 | 2.844 | 2.895 |
| 5.93761011528448 | 2.809 | 2.846 | 2.896 |
| 5.940751707938068 | 2.812 | 2.848 | 2.897 |
| 5.943893300591658 | 2.815 | 2.85 | 2.897 |
| 5.947034893245248 | 2.818 | 2.852 | 2.898 |
| 5.950176485898837 | 2.821 | 2.854 | 2.899 |
| 5.953318078552427 | 2.823 | 2.856 | 2.9 |
| 5.956459671206017 | 2.826 | 2.858 | 2.901 |
| 5.959601263859606 | 2.829 | 2.86 | 2.902 |
| 5.962742856513196 | 2.832 | 2.862 | 2.903 |
| 5.965884449166785 | 2.835 | 2.864 | 2.904 |
| 5.969026041820375 | 2.838 | 2.866 | 2.905 |
| 5.972167634473964 | 2.84 | 2.868 | 2.906 |
| 5.975309227127554 | 2.843 | 2.87 | 2.907 |
| 5.978450819781144 | 2.846 | 2.872 | 2.909 |
| 5.981592412434733 | 2.849 | 2.874 | 2.91 |
| 5.984734005088323 | 2.852 | 2.876 | 2.911 |
| 5.987875597741913 | 2.855 | 2.878 | 2.912 |
| 5.991017190395502 | 2.858 | 2.88 | 2.914 |
| 5.994158783049092 | 2.86 | 2.883 | 2.915 |
| 5.997300375702681 | 2.863 | 2.885 | 2.916 |
| 6.000441968356271 | 2.866 | 2.887 | 2.918 |
| 6.003583561009861 | 2.869 | 2.889 | 2.919 |
| 6.00672515366345 | 2.872 | 2.892 | 2.92 |
| 6.00986674631704 | 2.875 | 2.894 | 2.922 |
| 6.01300833897063 | 2.878 | 2.896 | 2.923 |
| 6.01614993162422 | 2.881 | 2.899 | 2.925 |
| 6.019291524277808 | 2.884 | 2.901 | 2.926 |
| 6.022433116931398 | 2.887 | 2.903 | 2.928 |
| 6.025574709584988 | 2.89 | 2.906 | 2.929 |
| 6.028716302238577 | 2.893 | 2.908 | 2.931 |
| 6.031857894892167 | 2.895 | 2.91 | 2.933 |
| 6.034999487545757 | 2.898 | 2.913 | 2.934 |
| 6.038141080199346 | 2.901 | 2.915 | 2.936 |
| 6.041282672852935 | 2.904 | 2.918 | 2.938 |
| 6.044424265506525 | 2.907 | 2.92 | 2.94 |
| 6.047565858160115 | 2.91 | 2.923 | 2.941 |
| 6.050707450813704 | 2.913 | 2.925 | 2.943 |
| 6.053849043467294 | 2.916 | 2.928 | 2.945 |
| 6.056990636120884 | 2.919 | 2.93 | 2.947 |
| 6.060132228774473 | 2.922 | 2.933 | 2.949 |
| 6.063273821428063 | 2.925 | 2.935 | 2.951 |
| 6.066415414081653 | 2.928 | 2.938 | 2.953 |
| 6.069557006735242 | 2.931 | 2.94 | 2.955 |
| 6.072698599388831 | 2.934 | 2.943 | 2.957 |
| 6.07584019204242 | 2.937 | 2.946 | 2.959 |
| 6.078981784696011 | 2.94 | 2.948 | 2.961 |
| 6.082123377349601 | 2.943 | 2.951 | 2.963 |
| 6.08526497000319 | 2.946 | 2.954 | 2.965 |
| 6.08840656265678 | 2.949 | 2.956 | 2.968 |
| 6.09154815531037 | 2.952 | 2.959 | 2.97 |
| 6.094689747963959 | 2.955 | 2.962 | 2.972 |
| 6.097831340617549 | 2.958 | 2.964 | 2.974 |
| 6.100972933271138 | 2.961 | 2.967 | 2.976 |
| 6.104114525924728 | 2.964 | 2.97 | 2.979 |
| 6.107256118578317 | 2.967 | 2.973 | 2.981 |
| 6.110397711231907 | 2.971 | 2.976 | 2.983 |
| 6.113539303885497 | 2.974 | 2.978 | 2.986 |
| 6.116680896539086 | 2.977 | 2.981 | 2.988 |
| 6.119822489192675 | 2.98 | 2.984 | 2.991 |
| 6.122964081846265 | 2.983 | 2.987 | 2.993 |
| 6.126105674499855 | 2.986 | 2.99 | 2.996 |
| 6.129247267153445 | 2.989 | 2.992 | 2.998 |
| 6.132388859807034 | 2.992 | 2.995 | 3.001 |
| 6.135530452460624 | 2.995 | 2.998 | 3.003 |
| 6.138672045114213 | 2.998 | 3.001 | 3.006 |
| 6.141813637767803 | 3.001 | 3.004 | 3.008 |
| 6.144955230421393 | 3.004 | 3.007 | 3.011 |
| 6.148096823074982 | 3.007 | 3.01 | 3.014 |
| 6.151238415728571 | 3.01 | 3.013 | 3.016 |
| 6.154380008382161 | 3.013 | 3.016 | 3.019 |
| 6.157521601035751 | 3.017 | 3.019 | 3.022 |
| 6.16066319368934 | 3.02 | 3.021 | 3.024 |
| 6.16380478634293 | 3.023 | 3.024 | 3.027 |
| 6.16694637899652 | 3.026 | 3.027 | 3.03 |
| 6.170087971650109 | 3.029 | 3.03 | 3.033 |
| 6.173229564303698 | 3.032 | 3.033 | 3.036 |
| 6.176371156957289 | 3.035 | 3.036 | 3.038 |
| 6.179512749610878 | 3.038 | 3.039 | 3.041 |
| 6.182654342264468 | 3.041 | 3.042 | 3.044 |
| 6.185795934918057 | 3.045 | 3.045 | 3.047 |
| 6.188937527571647 | 3.048 | 3.048 | 3.05 |
| 6.192079120225237 | 3.051 | 3.051 | 3.053 |
| 6.195220712878826 | 3.054 | 3.055 | 3.056 |
| 6.198362305532415 | 3.057 | 3.058 | 3.059 |
| 6.201503898186005 | 3.06 | 3.061 | 3.062 |
| 6.204645490839594 | 3.063 | 3.064 | 3.064 |
| 6.207787083493184 | 3.066 | 3.067 | 3.067 |
| 6.210928676146774 | 3.069 | 3.07 | 3.07 |
| 6.214070268800364 | 3.073 | 3.073 | 3.073 |
| 6.217211861453953 | 3.076 | 3.076 | 3.076 |
| 6.220353454107543 | 3.079 | 3.079 | 3.079 |
| 6.223495046761133 | 3.082 | 3.082 | 3.083 |
| 6.226636639414722 | 3.085 | 3.085 | 3.086 |
| 6.229778232068312 | 3.088 | 3.088 | 3.089 |
| 6.232919824721901 | 3.091 | 3.091 | 3.092 |
| 6.236061417375491 | 3.095 | 3.095 | 3.095 |
| 6.23920301002908 | 3.098 | 3.098 | 3.098 |
| 6.24234460268267 | 3.101 | 3.101 | 3.101 |
| 6.24548619533626 | 3.104 | 3.104 | 3.104 |
| 6.24862778798985 | 3.107 | 3.107 | 3.107 |
| 6.251769380643438 | 3.11 | 3.11 | 3.11 |
| 6.254910973297028 | 3.113 | 3.113 | 3.113 |
| 6.258052565950618 | 3.116 | 3.116 | 3.117 |
| 6.261194158604208 | 3.12 | 3.12 | 3.12 |
| 6.264335751257797 | 3.123 | 3.123 | 3.123 |
| 6.267477343911387 | 3.126 | 3.126 | 3.126 |
| 6.270618936564976 | 3.129 | 3.129 | 3.129 |
| 6.273760529218566 | 3.132 | 3.132 | 3.132 |
| 6.276902121872155 | 3.135 | 3.135 | 3.135 |
| 6.280043714525745 | 3.138 | 3.138 | 3.138 |
| 6.283185307179335 | 3.142 | 3.142 | 3.142 |